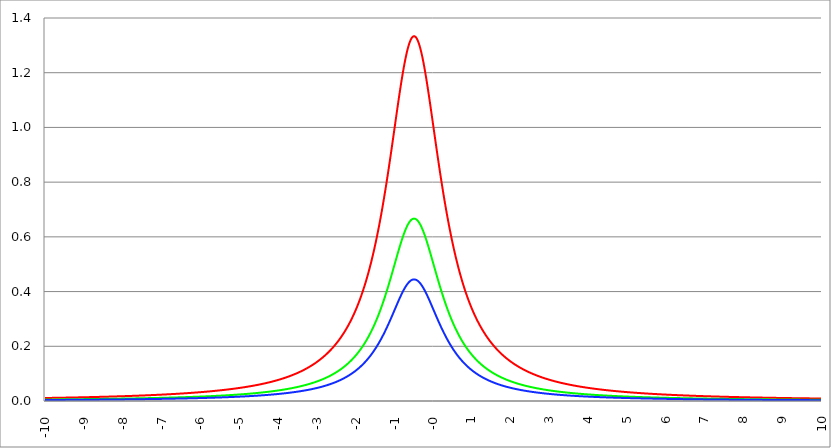
| Category | Series 1 | Series 0 | Series 2 |
|---|---|---|---|
| -10.0 | 0.011 | 0.005 | 0.004 |
| -9.99 | 0.011 | 0.006 | 0.004 |
| -9.98 | 0.011 | 0.006 | 0.004 |
| -9.97 | 0.011 | 0.006 | 0.004 |
| -9.96 | 0.011 | 0.006 | 0.004 |
| -9.95 | 0.011 | 0.006 | 0.004 |
| -9.940000000000001 | 0.011 | 0.006 | 0.004 |
| -9.930000000000001 | 0.011 | 0.006 | 0.004 |
| -9.920000000000002 | 0.011 | 0.006 | 0.004 |
| -9.91 | 0.011 | 0.006 | 0.004 |
| -9.900000000000002 | 0.011 | 0.006 | 0.004 |
| -9.890000000000002 | 0.011 | 0.006 | 0.004 |
| -9.880000000000003 | 0.011 | 0.006 | 0.004 |
| -9.870000000000003 | 0.011 | 0.006 | 0.004 |
| -9.860000000000001 | 0.011 | 0.006 | 0.004 |
| -9.850000000000003 | 0.011 | 0.006 | 0.004 |
| -9.840000000000003 | 0.011 | 0.006 | 0.004 |
| -9.830000000000004 | 0.011 | 0.006 | 0.004 |
| -9.820000000000004 | 0.011 | 0.006 | 0.004 |
| -9.810000000000004 | 0.011 | 0.006 | 0.004 |
| -9.800000000000004 | 0.011 | 0.006 | 0.004 |
| -9.790000000000004 | 0.011 | 0.006 | 0.004 |
| -9.780000000000005 | 0.012 | 0.006 | 0.004 |
| -9.770000000000005 | 0.012 | 0.006 | 0.004 |
| -9.760000000000005 | 0.012 | 0.006 | 0.004 |
| -9.750000000000005 | 0.012 | 0.006 | 0.004 |
| -9.740000000000006 | 0.012 | 0.006 | 0.004 |
| -9.730000000000006 | 0.012 | 0.006 | 0.004 |
| -9.720000000000006 | 0.012 | 0.006 | 0.004 |
| -9.710000000000006 | 0.012 | 0.006 | 0.004 |
| -9.700000000000006 | 0.012 | 0.006 | 0.004 |
| -9.690000000000007 | 0.012 | 0.006 | 0.004 |
| -9.680000000000007 | 0.012 | 0.006 | 0.004 |
| -9.670000000000007 | 0.012 | 0.006 | 0.004 |
| -9.660000000000007 | 0.012 | 0.006 | 0.004 |
| -9.650000000000007 | 0.012 | 0.006 | 0.004 |
| -9.640000000000008 | 0.012 | 0.006 | 0.004 |
| -9.630000000000008 | 0.012 | 0.006 | 0.004 |
| -9.620000000000008 | 0.012 | 0.006 | 0.004 |
| -9.610000000000008 | 0.012 | 0.006 | 0.004 |
| -9.600000000000009 | 0.012 | 0.006 | 0.004 |
| -9.590000000000009 | 0.012 | 0.006 | 0.004 |
| -9.580000000000007 | 0.012 | 0.006 | 0.004 |
| -9.57000000000001 | 0.012 | 0.006 | 0.004 |
| -9.56000000000001 | 0.012 | 0.006 | 0.004 |
| -9.55000000000001 | 0.012 | 0.006 | 0.004 |
| -9.54000000000001 | 0.012 | 0.006 | 0.004 |
| -9.53000000000001 | 0.012 | 0.006 | 0.004 |
| -9.52000000000001 | 0.012 | 0.006 | 0.004 |
| -9.51000000000001 | 0.012 | 0.006 | 0.004 |
| -9.50000000000001 | 0.012 | 0.006 | 0.004 |
| -9.49000000000001 | 0.012 | 0.006 | 0.004 |
| -9.48000000000001 | 0.012 | 0.006 | 0.004 |
| -9.47000000000001 | 0.012 | 0.006 | 0.004 |
| -9.46000000000001 | 0.012 | 0.006 | 0.004 |
| -9.45000000000001 | 0.012 | 0.006 | 0.004 |
| -9.44000000000001 | 0.012 | 0.006 | 0.004 |
| -9.430000000000012 | 0.012 | 0.006 | 0.004 |
| -9.420000000000012 | 0.012 | 0.006 | 0.004 |
| -9.410000000000013 | 0.012 | 0.006 | 0.004 |
| -9.400000000000013 | 0.013 | 0.006 | 0.004 |
| -9.390000000000011 | 0.013 | 0.006 | 0.004 |
| -9.380000000000013 | 0.013 | 0.006 | 0.004 |
| -9.370000000000013 | 0.013 | 0.006 | 0.004 |
| -9.360000000000014 | 0.013 | 0.006 | 0.004 |
| -9.350000000000014 | 0.013 | 0.006 | 0.004 |
| -9.340000000000014 | 0.013 | 0.006 | 0.004 |
| -9.330000000000014 | 0.013 | 0.006 | 0.004 |
| -9.320000000000014 | 0.013 | 0.006 | 0.004 |
| -9.310000000000015 | 0.013 | 0.006 | 0.004 |
| -9.300000000000013 | 0.013 | 0.006 | 0.004 |
| -9.290000000000015 | 0.013 | 0.006 | 0.004 |
| -9.280000000000015 | 0.013 | 0.006 | 0.004 |
| -9.270000000000016 | 0.013 | 0.006 | 0.004 |
| -9.260000000000016 | 0.013 | 0.006 | 0.004 |
| -9.250000000000014 | 0.013 | 0.006 | 0.004 |
| -9.240000000000016 | 0.013 | 0.006 | 0.004 |
| -9.230000000000016 | 0.013 | 0.006 | 0.004 |
| -9.220000000000017 | 0.013 | 0.007 | 0.004 |
| -9.210000000000017 | 0.013 | 0.007 | 0.004 |
| -9.200000000000017 | 0.013 | 0.007 | 0.004 |
| -9.190000000000017 | 0.013 | 0.007 | 0.004 |
| -9.180000000000017 | 0.013 | 0.007 | 0.004 |
| -9.170000000000018 | 0.013 | 0.007 | 0.004 |
| -9.160000000000016 | 0.013 | 0.007 | 0.004 |
| -9.150000000000018 | 0.013 | 0.007 | 0.004 |
| -9.140000000000018 | 0.013 | 0.007 | 0.004 |
| -9.130000000000019 | 0.013 | 0.007 | 0.004 |
| -9.120000000000019 | 0.013 | 0.007 | 0.004 |
| -9.110000000000017 | 0.013 | 0.007 | 0.004 |
| -9.10000000000002 | 0.013 | 0.007 | 0.004 |
| -9.09000000000002 | 0.013 | 0.007 | 0.004 |
| -9.08000000000002 | 0.013 | 0.007 | 0.004 |
| -9.07000000000002 | 0.013 | 0.007 | 0.004 |
| -9.06000000000002 | 0.014 | 0.007 | 0.005 |
| -9.05000000000002 | 0.014 | 0.007 | 0.005 |
| -9.04000000000002 | 0.014 | 0.007 | 0.005 |
| -9.03000000000002 | 0.014 | 0.007 | 0.005 |
| -9.020000000000021 | 0.014 | 0.007 | 0.005 |
| -9.010000000000021 | 0.014 | 0.007 | 0.005 |
| -9.000000000000021 | 0.014 | 0.007 | 0.005 |
| -8.990000000000022 | 0.014 | 0.007 | 0.005 |
| -8.980000000000022 | 0.014 | 0.007 | 0.005 |
| -8.97000000000002 | 0.014 | 0.007 | 0.005 |
| -8.960000000000022 | 0.014 | 0.007 | 0.005 |
| -8.950000000000022 | 0.014 | 0.007 | 0.005 |
| -8.940000000000023 | 0.014 | 0.007 | 0.005 |
| -8.930000000000023 | 0.014 | 0.007 | 0.005 |
| -8.920000000000023 | 0.014 | 0.007 | 0.005 |
| -8.910000000000023 | 0.014 | 0.007 | 0.005 |
| -8.900000000000023 | 0.014 | 0.007 | 0.005 |
| -8.890000000000024 | 0.014 | 0.007 | 0.005 |
| -8.880000000000024 | 0.014 | 0.007 | 0.005 |
| -8.870000000000024 | 0.014 | 0.007 | 0.005 |
| -8.860000000000024 | 0.014 | 0.007 | 0.005 |
| -8.850000000000025 | 0.014 | 0.007 | 0.005 |
| -8.840000000000025 | 0.014 | 0.007 | 0.005 |
| -8.830000000000025 | 0.014 | 0.007 | 0.005 |
| -8.820000000000025 | 0.014 | 0.007 | 0.005 |
| -8.810000000000025 | 0.014 | 0.007 | 0.005 |
| -8.800000000000026 | 0.014 | 0.007 | 0.005 |
| -8.790000000000026 | 0.014 | 0.007 | 0.005 |
| -8.780000000000026 | 0.014 | 0.007 | 0.005 |
| -8.770000000000026 | 0.014 | 0.007 | 0.005 |
| -8.760000000000026 | 0.014 | 0.007 | 0.005 |
| -8.750000000000027 | 0.015 | 0.007 | 0.005 |
| -8.740000000000027 | 0.015 | 0.007 | 0.005 |
| -8.730000000000027 | 0.015 | 0.007 | 0.005 |
| -8.720000000000027 | 0.015 | 0.007 | 0.005 |
| -8.710000000000027 | 0.015 | 0.007 | 0.005 |
| -8.700000000000028 | 0.015 | 0.007 | 0.005 |
| -8.690000000000028 | 0.015 | 0.007 | 0.005 |
| -8.680000000000028 | 0.015 | 0.007 | 0.005 |
| -8.670000000000028 | 0.015 | 0.007 | 0.005 |
| -8.660000000000029 | 0.015 | 0.007 | 0.005 |
| -8.650000000000029 | 0.015 | 0.007 | 0.005 |
| -8.640000000000029 | 0.015 | 0.007 | 0.005 |
| -8.63000000000003 | 0.015 | 0.007 | 0.005 |
| -8.62000000000003 | 0.015 | 0.007 | 0.005 |
| -8.61000000000003 | 0.015 | 0.008 | 0.005 |
| -8.60000000000003 | 0.015 | 0.008 | 0.005 |
| -8.59000000000003 | 0.015 | 0.008 | 0.005 |
| -8.58000000000003 | 0.015 | 0.008 | 0.005 |
| -8.57000000000003 | 0.015 | 0.008 | 0.005 |
| -8.56000000000003 | 0.015 | 0.008 | 0.005 |
| -8.55000000000003 | 0.015 | 0.008 | 0.005 |
| -8.540000000000031 | 0.015 | 0.008 | 0.005 |
| -8.530000000000031 | 0.015 | 0.008 | 0.005 |
| -8.520000000000032 | 0.015 | 0.008 | 0.005 |
| -8.510000000000032 | 0.015 | 0.008 | 0.005 |
| -8.50000000000003 | 0.015 | 0.008 | 0.005 |
| -8.490000000000032 | 0.015 | 0.008 | 0.005 |
| -8.480000000000032 | 0.016 | 0.008 | 0.005 |
| -8.470000000000033 | 0.016 | 0.008 | 0.005 |
| -8.460000000000033 | 0.016 | 0.008 | 0.005 |
| -8.450000000000033 | 0.016 | 0.008 | 0.005 |
| -8.440000000000033 | 0.016 | 0.008 | 0.005 |
| -8.430000000000033 | 0.016 | 0.008 | 0.005 |
| -8.420000000000034 | 0.016 | 0.008 | 0.005 |
| -8.410000000000032 | 0.016 | 0.008 | 0.005 |
| -8.400000000000034 | 0.016 | 0.008 | 0.005 |
| -8.390000000000034 | 0.016 | 0.008 | 0.005 |
| -8.380000000000035 | 0.016 | 0.008 | 0.005 |
| -8.370000000000035 | 0.016 | 0.008 | 0.005 |
| -8.360000000000033 | 0.016 | 0.008 | 0.005 |
| -8.350000000000035 | 0.016 | 0.008 | 0.005 |
| -8.340000000000035 | 0.016 | 0.008 | 0.005 |
| -8.330000000000036 | 0.016 | 0.008 | 0.005 |
| -8.320000000000036 | 0.016 | 0.008 | 0.005 |
| -8.310000000000034 | 0.016 | 0.008 | 0.005 |
| -8.300000000000036 | 0.016 | 0.008 | 0.005 |
| -8.290000000000036 | 0.016 | 0.008 | 0.005 |
| -8.280000000000037 | 0.016 | 0.008 | 0.005 |
| -8.270000000000037 | 0.016 | 0.008 | 0.005 |
| -8.260000000000037 | 0.016 | 0.008 | 0.005 |
| -8.250000000000037 | 0.016 | 0.008 | 0.005 |
| -8.240000000000038 | 0.016 | 0.008 | 0.005 |
| -8.230000000000038 | 0.017 | 0.008 | 0.006 |
| -8.220000000000038 | 0.017 | 0.008 | 0.006 |
| -8.210000000000038 | 0.017 | 0.008 | 0.006 |
| -8.200000000000038 | 0.017 | 0.008 | 0.006 |
| -8.190000000000039 | 0.017 | 0.008 | 0.006 |
| -8.180000000000039 | 0.017 | 0.008 | 0.006 |
| -8.170000000000037 | 0.017 | 0.008 | 0.006 |
| -8.16000000000004 | 0.017 | 0.008 | 0.006 |
| -8.15000000000004 | 0.017 | 0.008 | 0.006 |
| -8.14000000000004 | 0.017 | 0.008 | 0.006 |
| -8.13000000000004 | 0.017 | 0.008 | 0.006 |
| -8.12000000000004 | 0.017 | 0.009 | 0.006 |
| -8.11000000000004 | 0.017 | 0.009 | 0.006 |
| -8.10000000000004 | 0.017 | 0.009 | 0.006 |
| -8.09000000000004 | 0.017 | 0.009 | 0.006 |
| -8.08000000000004 | 0.017 | 0.009 | 0.006 |
| -8.07000000000004 | 0.017 | 0.009 | 0.006 |
| -8.06000000000004 | 0.017 | 0.009 | 0.006 |
| -8.05000000000004 | 0.017 | 0.009 | 0.006 |
| -8.040000000000042 | 0.017 | 0.009 | 0.006 |
| -8.03000000000004 | 0.017 | 0.009 | 0.006 |
| -8.020000000000042 | 0.017 | 0.009 | 0.006 |
| -8.010000000000042 | 0.017 | 0.009 | 0.006 |
| -8.000000000000043 | 0.018 | 0.009 | 0.006 |
| -7.990000000000043 | 0.018 | 0.009 | 0.006 |
| -7.980000000000043 | 0.018 | 0.009 | 0.006 |
| -7.970000000000043 | 0.018 | 0.009 | 0.006 |
| -7.960000000000043 | 0.018 | 0.009 | 0.006 |
| -7.950000000000044 | 0.018 | 0.009 | 0.006 |
| -7.940000000000044 | 0.018 | 0.009 | 0.006 |
| -7.930000000000044 | 0.018 | 0.009 | 0.006 |
| -7.920000000000044 | 0.018 | 0.009 | 0.006 |
| -7.910000000000044 | 0.018 | 0.009 | 0.006 |
| -7.900000000000044 | 0.018 | 0.009 | 0.006 |
| -7.890000000000045 | 0.018 | 0.009 | 0.006 |
| -7.880000000000045 | 0.018 | 0.009 | 0.006 |
| -7.870000000000045 | 0.018 | 0.009 | 0.006 |
| -7.860000000000046 | 0.018 | 0.009 | 0.006 |
| -7.850000000000046 | 0.018 | 0.009 | 0.006 |
| -7.840000000000046 | 0.018 | 0.009 | 0.006 |
| -7.830000000000046 | 0.018 | 0.009 | 0.006 |
| -7.820000000000046 | 0.018 | 0.009 | 0.006 |
| -7.810000000000047 | 0.018 | 0.009 | 0.006 |
| -7.800000000000047 | 0.019 | 0.009 | 0.006 |
| -7.790000000000047 | 0.019 | 0.009 | 0.006 |
| -7.780000000000047 | 0.019 | 0.009 | 0.006 |
| -7.770000000000047 | 0.019 | 0.009 | 0.006 |
| -7.760000000000048 | 0.019 | 0.009 | 0.006 |
| -7.750000000000048 | 0.019 | 0.009 | 0.006 |
| -7.740000000000048 | 0.019 | 0.009 | 0.006 |
| -7.730000000000048 | 0.019 | 0.009 | 0.006 |
| -7.720000000000049 | 0.019 | 0.009 | 0.006 |
| -7.710000000000049 | 0.019 | 0.009 | 0.006 |
| -7.700000000000049 | 0.019 | 0.01 | 0.006 |
| -7.690000000000049 | 0.019 | 0.01 | 0.006 |
| -7.680000000000049 | 0.019 | 0.01 | 0.006 |
| -7.67000000000005 | 0.019 | 0.01 | 0.006 |
| -7.66000000000005 | 0.019 | 0.01 | 0.006 |
| -7.65000000000005 | 0.019 | 0.01 | 0.006 |
| -7.64000000000005 | 0.019 | 0.01 | 0.006 |
| -7.63000000000005 | 0.019 | 0.01 | 0.006 |
| -7.620000000000051 | 0.019 | 0.01 | 0.006 |
| -7.610000000000051 | 0.019 | 0.01 | 0.006 |
| -7.600000000000051 | 0.02 | 0.01 | 0.007 |
| -7.590000000000051 | 0.02 | 0.01 | 0.007 |
| -7.580000000000052 | 0.02 | 0.01 | 0.007 |
| -7.570000000000052 | 0.02 | 0.01 | 0.007 |
| -7.560000000000052 | 0.02 | 0.01 | 0.007 |
| -7.550000000000052 | 0.02 | 0.01 | 0.007 |
| -7.540000000000052 | 0.02 | 0.01 | 0.007 |
| -7.530000000000053 | 0.02 | 0.01 | 0.007 |
| -7.520000000000053 | 0.02 | 0.01 | 0.007 |
| -7.510000000000053 | 0.02 | 0.01 | 0.007 |
| -7.500000000000053 | 0.02 | 0.01 | 0.007 |
| -7.490000000000053 | 0.02 | 0.01 | 0.007 |
| -7.480000000000054 | 0.02 | 0.01 | 0.007 |
| -7.470000000000054 | 0.02 | 0.01 | 0.007 |
| -7.460000000000054 | 0.02 | 0.01 | 0.007 |
| -7.450000000000054 | 0.02 | 0.01 | 0.007 |
| -7.440000000000054 | 0.02 | 0.01 | 0.007 |
| -7.430000000000054 | 0.021 | 0.01 | 0.007 |
| -7.420000000000055 | 0.021 | 0.01 | 0.007 |
| -7.410000000000055 | 0.021 | 0.01 | 0.007 |
| -7.400000000000055 | 0.021 | 0.01 | 0.007 |
| -7.390000000000056 | 0.021 | 0.01 | 0.007 |
| -7.380000000000056 | 0.021 | 0.01 | 0.007 |
| -7.370000000000056 | 0.021 | 0.01 | 0.007 |
| -7.360000000000056 | 0.021 | 0.01 | 0.007 |
| -7.350000000000056 | 0.021 | 0.01 | 0.007 |
| -7.340000000000057 | 0.021 | 0.011 | 0.007 |
| -7.330000000000057 | 0.021 | 0.011 | 0.007 |
| -7.320000000000057 | 0.021 | 0.011 | 0.007 |
| -7.310000000000057 | 0.021 | 0.011 | 0.007 |
| -7.300000000000058 | 0.021 | 0.011 | 0.007 |
| -7.290000000000058 | 0.021 | 0.011 | 0.007 |
| -7.280000000000058 | 0.021 | 0.011 | 0.007 |
| -7.270000000000058 | 0.021 | 0.011 | 0.007 |
| -7.260000000000058 | 0.022 | 0.011 | 0.007 |
| -7.250000000000059 | 0.022 | 0.011 | 0.007 |
| -7.240000000000059 | 0.022 | 0.011 | 0.007 |
| -7.23000000000006 | 0.022 | 0.011 | 0.007 |
| -7.220000000000059 | 0.022 | 0.011 | 0.007 |
| -7.210000000000059 | 0.022 | 0.011 | 0.007 |
| -7.20000000000006 | 0.022 | 0.011 | 0.007 |
| -7.19000000000006 | 0.022 | 0.011 | 0.007 |
| -7.18000000000006 | 0.022 | 0.011 | 0.007 |
| -7.17000000000006 | 0.022 | 0.011 | 0.007 |
| -7.160000000000061 | 0.022 | 0.011 | 0.007 |
| -7.150000000000061 | 0.022 | 0.011 | 0.007 |
| -7.140000000000061 | 0.022 | 0.011 | 0.007 |
| -7.130000000000061 | 0.022 | 0.011 | 0.007 |
| -7.120000000000061 | 0.022 | 0.011 | 0.007 |
| -7.110000000000062 | 0.023 | 0.011 | 0.008 |
| -7.100000000000062 | 0.023 | 0.011 | 0.008 |
| -7.090000000000062 | 0.023 | 0.011 | 0.008 |
| -7.080000000000062 | 0.023 | 0.011 | 0.008 |
| -7.070000000000062 | 0.023 | 0.011 | 0.008 |
| -7.060000000000063 | 0.023 | 0.011 | 0.008 |
| -7.050000000000063 | 0.023 | 0.011 | 0.008 |
| -7.040000000000063 | 0.023 | 0.011 | 0.008 |
| -7.030000000000063 | 0.023 | 0.012 | 0.008 |
| -7.020000000000064 | 0.023 | 0.012 | 0.008 |
| -7.010000000000064 | 0.023 | 0.012 | 0.008 |
| -7.000000000000064 | 0.023 | 0.012 | 0.008 |
| -6.990000000000064 | 0.023 | 0.012 | 0.008 |
| -6.980000000000064 | 0.023 | 0.012 | 0.008 |
| -6.970000000000064 | 0.023 | 0.012 | 0.008 |
| -6.960000000000064 | 0.024 | 0.012 | 0.008 |
| -6.950000000000064 | 0.024 | 0.012 | 0.008 |
| -6.940000000000065 | 0.024 | 0.012 | 0.008 |
| -6.930000000000065 | 0.024 | 0.012 | 0.008 |
| -6.920000000000065 | 0.024 | 0.012 | 0.008 |
| -6.910000000000065 | 0.024 | 0.012 | 0.008 |
| -6.900000000000066 | 0.024 | 0.012 | 0.008 |
| -6.890000000000066 | 0.024 | 0.012 | 0.008 |
| -6.880000000000066 | 0.024 | 0.012 | 0.008 |
| -6.870000000000066 | 0.024 | 0.012 | 0.008 |
| -6.860000000000067 | 0.024 | 0.012 | 0.008 |
| -6.850000000000067 | 0.024 | 0.012 | 0.008 |
| -6.840000000000067 | 0.024 | 0.012 | 0.008 |
| -6.830000000000067 | 0.024 | 0.012 | 0.008 |
| -6.820000000000068 | 0.025 | 0.012 | 0.008 |
| -6.810000000000068 | 0.025 | 0.012 | 0.008 |
| -6.800000000000068 | 0.025 | 0.012 | 0.008 |
| -6.790000000000068 | 0.025 | 0.012 | 0.008 |
| -6.780000000000068 | 0.025 | 0.012 | 0.008 |
| -6.770000000000068 | 0.025 | 0.012 | 0.008 |
| -6.760000000000069 | 0.025 | 0.013 | 0.008 |
| -6.75000000000007 | 0.025 | 0.013 | 0.008 |
| -6.74000000000007 | 0.025 | 0.013 | 0.008 |
| -6.73000000000007 | 0.025 | 0.013 | 0.008 |
| -6.72000000000007 | 0.025 | 0.013 | 0.008 |
| -6.71000000000007 | 0.025 | 0.013 | 0.008 |
| -6.70000000000007 | 0.026 | 0.013 | 0.009 |
| -6.69000000000007 | 0.026 | 0.013 | 0.009 |
| -6.680000000000071 | 0.026 | 0.013 | 0.009 |
| -6.670000000000071 | 0.026 | 0.013 | 0.009 |
| -6.660000000000071 | 0.026 | 0.013 | 0.009 |
| -6.650000000000071 | 0.026 | 0.013 | 0.009 |
| -6.640000000000072 | 0.026 | 0.013 | 0.009 |
| -6.630000000000072 | 0.026 | 0.013 | 0.009 |
| -6.620000000000072 | 0.026 | 0.013 | 0.009 |
| -6.610000000000072 | 0.026 | 0.013 | 0.009 |
| -6.600000000000072 | 0.026 | 0.013 | 0.009 |
| -6.590000000000073 | 0.026 | 0.013 | 0.009 |
| -6.580000000000073 | 0.027 | 0.013 | 0.009 |
| -6.570000000000073 | 0.027 | 0.013 | 0.009 |
| -6.560000000000073 | 0.027 | 0.013 | 0.009 |
| -6.550000000000074 | 0.027 | 0.013 | 0.009 |
| -6.540000000000074 | 0.027 | 0.013 | 0.009 |
| -6.530000000000074 | 0.027 | 0.013 | 0.009 |
| -6.520000000000074 | 0.027 | 0.014 | 0.009 |
| -6.510000000000074 | 0.027 | 0.014 | 0.009 |
| -6.500000000000074 | 0.027 | 0.014 | 0.009 |
| -6.490000000000074 | 0.027 | 0.014 | 0.009 |
| -6.480000000000074 | 0.027 | 0.014 | 0.009 |
| -6.470000000000075 | 0.027 | 0.014 | 0.009 |
| -6.460000000000075 | 0.028 | 0.014 | 0.009 |
| -6.450000000000075 | 0.028 | 0.014 | 0.009 |
| -6.440000000000075 | 0.028 | 0.014 | 0.009 |
| -6.430000000000076 | 0.028 | 0.014 | 0.009 |
| -6.420000000000076 | 0.028 | 0.014 | 0.009 |
| -6.410000000000076 | 0.028 | 0.014 | 0.009 |
| -6.400000000000076 | 0.028 | 0.014 | 0.009 |
| -6.390000000000077 | 0.028 | 0.014 | 0.009 |
| -6.380000000000077 | 0.028 | 0.014 | 0.009 |
| -6.370000000000077 | 0.028 | 0.014 | 0.009 |
| -6.360000000000078 | 0.028 | 0.014 | 0.009 |
| -6.350000000000078 | 0.029 | 0.014 | 0.01 |
| -6.340000000000078 | 0.029 | 0.014 | 0.01 |
| -6.330000000000078 | 0.029 | 0.014 | 0.01 |
| -6.320000000000078 | 0.029 | 0.014 | 0.01 |
| -6.310000000000079 | 0.029 | 0.014 | 0.01 |
| -6.300000000000079 | 0.029 | 0.015 | 0.01 |
| -6.29000000000008 | 0.029 | 0.015 | 0.01 |
| -6.28000000000008 | 0.029 | 0.015 | 0.01 |
| -6.27000000000008 | 0.029 | 0.015 | 0.01 |
| -6.26000000000008 | 0.029 | 0.015 | 0.01 |
| -6.25000000000008 | 0.03 | 0.015 | 0.01 |
| -6.24000000000008 | 0.03 | 0.015 | 0.01 |
| -6.23000000000008 | 0.03 | 0.015 | 0.01 |
| -6.220000000000081 | 0.03 | 0.015 | 0.01 |
| -6.210000000000081 | 0.03 | 0.015 | 0.01 |
| -6.200000000000081 | 0.03 | 0.015 | 0.01 |
| -6.190000000000081 | 0.03 | 0.015 | 0.01 |
| -6.180000000000081 | 0.03 | 0.015 | 0.01 |
| -6.170000000000082 | 0.03 | 0.015 | 0.01 |
| -6.160000000000082 | 0.031 | 0.015 | 0.01 |
| -6.150000000000082 | 0.031 | 0.015 | 0.01 |
| -6.140000000000082 | 0.031 | 0.015 | 0.01 |
| -6.130000000000082 | 0.031 | 0.015 | 0.01 |
| -6.120000000000083 | 0.031 | 0.015 | 0.01 |
| -6.110000000000083 | 0.031 | 0.016 | 0.01 |
| -6.100000000000083 | 0.031 | 0.016 | 0.01 |
| -6.090000000000083 | 0.031 | 0.016 | 0.01 |
| -6.080000000000084 | 0.031 | 0.016 | 0.01 |
| -6.070000000000084 | 0.031 | 0.016 | 0.01 |
| -6.060000000000084 | 0.032 | 0.016 | 0.011 |
| -6.050000000000084 | 0.032 | 0.016 | 0.011 |
| -6.040000000000084 | 0.032 | 0.016 | 0.011 |
| -6.030000000000084 | 0.032 | 0.016 | 0.011 |
| -6.020000000000085 | 0.032 | 0.016 | 0.011 |
| -6.010000000000085 | 0.032 | 0.016 | 0.011 |
| -6.000000000000085 | 0.032 | 0.016 | 0.011 |
| -5.990000000000085 | 0.032 | 0.016 | 0.011 |
| -5.980000000000085 | 0.032 | 0.016 | 0.011 |
| -5.970000000000085 | 0.033 | 0.016 | 0.011 |
| -5.960000000000086 | 0.033 | 0.016 | 0.011 |
| -5.950000000000086 | 0.033 | 0.016 | 0.011 |
| -5.940000000000086 | 0.033 | 0.016 | 0.011 |
| -5.930000000000086 | 0.033 | 0.017 | 0.011 |
| -5.920000000000087 | 0.033 | 0.017 | 0.011 |
| -5.910000000000087 | 0.033 | 0.017 | 0.011 |
| -5.900000000000087 | 0.033 | 0.017 | 0.011 |
| -5.890000000000088 | 0.034 | 0.017 | 0.011 |
| -5.880000000000088 | 0.034 | 0.017 | 0.011 |
| -5.870000000000088 | 0.034 | 0.017 | 0.011 |
| -5.860000000000088 | 0.034 | 0.017 | 0.011 |
| -5.850000000000088 | 0.034 | 0.017 | 0.011 |
| -5.840000000000089 | 0.034 | 0.017 | 0.011 |
| -5.830000000000089 | 0.034 | 0.017 | 0.011 |
| -5.820000000000089 | 0.034 | 0.017 | 0.011 |
| -5.810000000000089 | 0.035 | 0.017 | 0.012 |
| -5.800000000000089 | 0.035 | 0.017 | 0.012 |
| -5.79000000000009 | 0.035 | 0.017 | 0.012 |
| -5.78000000000009 | 0.035 | 0.017 | 0.012 |
| -5.77000000000009 | 0.035 | 0.018 | 0.012 |
| -5.76000000000009 | 0.035 | 0.018 | 0.012 |
| -5.750000000000091 | 0.035 | 0.018 | 0.012 |
| -5.740000000000091 | 0.035 | 0.018 | 0.012 |
| -5.730000000000091 | 0.036 | 0.018 | 0.012 |
| -5.720000000000091 | 0.036 | 0.018 | 0.012 |
| -5.710000000000091 | 0.036 | 0.018 | 0.012 |
| -5.700000000000092 | 0.036 | 0.018 | 0.012 |
| -5.690000000000092 | 0.036 | 0.018 | 0.012 |
| -5.680000000000092 | 0.036 | 0.018 | 0.012 |
| -5.670000000000092 | 0.036 | 0.018 | 0.012 |
| -5.660000000000092 | 0.037 | 0.018 | 0.012 |
| -5.650000000000093 | 0.037 | 0.018 | 0.012 |
| -5.640000000000093 | 0.037 | 0.018 | 0.012 |
| -5.630000000000093 | 0.037 | 0.018 | 0.012 |
| -5.620000000000093 | 0.037 | 0.019 | 0.012 |
| -5.610000000000093 | 0.037 | 0.019 | 0.012 |
| -5.600000000000094 | 0.037 | 0.019 | 0.012 |
| -5.590000000000094 | 0.038 | 0.019 | 0.013 |
| -5.580000000000094 | 0.038 | 0.019 | 0.013 |
| -5.570000000000094 | 0.038 | 0.019 | 0.013 |
| -5.560000000000095 | 0.038 | 0.019 | 0.013 |
| -5.550000000000095 | 0.038 | 0.019 | 0.013 |
| -5.540000000000095 | 0.038 | 0.019 | 0.013 |
| -5.530000000000095 | 0.038 | 0.019 | 0.013 |
| -5.520000000000095 | 0.039 | 0.019 | 0.013 |
| -5.510000000000096 | 0.039 | 0.019 | 0.013 |
| -5.500000000000096 | 0.039 | 0.019 | 0.013 |
| -5.490000000000096 | 0.039 | 0.019 | 0.013 |
| -5.480000000000096 | 0.039 | 0.02 | 0.013 |
| -5.470000000000096 | 0.039 | 0.02 | 0.013 |
| -5.460000000000097 | 0.039 | 0.02 | 0.013 |
| -5.450000000000097 | 0.04 | 0.02 | 0.013 |
| -5.440000000000097 | 0.04 | 0.02 | 0.013 |
| -5.430000000000097 | 0.04 | 0.02 | 0.013 |
| -5.420000000000098 | 0.04 | 0.02 | 0.013 |
| -5.410000000000098 | 0.04 | 0.02 | 0.013 |
| -5.400000000000098 | 0.04 | 0.02 | 0.013 |
| -5.390000000000098 | 0.041 | 0.02 | 0.014 |
| -5.380000000000098 | 0.041 | 0.02 | 0.014 |
| -5.370000000000099 | 0.041 | 0.02 | 0.014 |
| -5.360000000000099 | 0.041 | 0.021 | 0.014 |
| -5.350000000000099 | 0.041 | 0.021 | 0.014 |
| -5.340000000000099 | 0.041 | 0.021 | 0.014 |
| -5.330000000000099 | 0.042 | 0.021 | 0.014 |
| -5.3200000000001 | 0.042 | 0.021 | 0.014 |
| -5.3100000000001 | 0.042 | 0.021 | 0.014 |
| -5.3000000000001 | 0.042 | 0.021 | 0.014 |
| -5.2900000000001 | 0.042 | 0.021 | 0.014 |
| -5.2800000000001 | 0.042 | 0.021 | 0.014 |
| -5.2700000000001 | 0.043 | 0.021 | 0.014 |
| -5.260000000000101 | 0.043 | 0.021 | 0.014 |
| -5.250000000000101 | 0.043 | 0.021 | 0.014 |
| -5.240000000000101 | 0.043 | 0.022 | 0.014 |
| -5.230000000000101 | 0.043 | 0.022 | 0.014 |
| -5.220000000000102 | 0.043 | 0.022 | 0.014 |
| -5.210000000000102 | 0.044 | 0.022 | 0.015 |
| -5.200000000000102 | 0.044 | 0.022 | 0.015 |
| -5.190000000000103 | 0.044 | 0.022 | 0.015 |
| -5.180000000000103 | 0.044 | 0.022 | 0.015 |
| -5.170000000000103 | 0.044 | 0.022 | 0.015 |
| -5.160000000000103 | 0.045 | 0.022 | 0.015 |
| -5.150000000000103 | 0.045 | 0.022 | 0.015 |
| -5.140000000000104 | 0.045 | 0.022 | 0.015 |
| -5.130000000000104 | 0.045 | 0.023 | 0.015 |
| -5.120000000000104 | 0.045 | 0.023 | 0.015 |
| -5.110000000000104 | 0.045 | 0.023 | 0.015 |
| -5.100000000000104 | 0.046 | 0.023 | 0.015 |
| -5.090000000000104 | 0.046 | 0.023 | 0.015 |
| -5.080000000000104 | 0.046 | 0.023 | 0.015 |
| -5.070000000000105 | 0.046 | 0.023 | 0.015 |
| -5.060000000000105 | 0.046 | 0.023 | 0.015 |
| -5.050000000000105 | 0.047 | 0.023 | 0.016 |
| -5.040000000000105 | 0.047 | 0.023 | 0.016 |
| -5.030000000000105 | 0.047 | 0.024 | 0.016 |
| -5.020000000000106 | 0.047 | 0.024 | 0.016 |
| -5.010000000000106 | 0.047 | 0.024 | 0.016 |
| -5.000000000000106 | 0.048 | 0.024 | 0.016 |
| -4.990000000000106 | 0.048 | 0.024 | 0.016 |
| -4.980000000000106 | 0.048 | 0.024 | 0.016 |
| -4.970000000000107 | 0.048 | 0.024 | 0.016 |
| -4.960000000000107 | 0.048 | 0.024 | 0.016 |
| -4.950000000000107 | 0.049 | 0.024 | 0.016 |
| -4.940000000000107 | 0.049 | 0.024 | 0.016 |
| -4.930000000000108 | 0.049 | 0.025 | 0.016 |
| -4.920000000000108 | 0.049 | 0.025 | 0.016 |
| -4.910000000000108 | 0.05 | 0.025 | 0.017 |
| -4.900000000000108 | 0.05 | 0.025 | 0.017 |
| -4.890000000000109 | 0.05 | 0.025 | 0.017 |
| -4.88000000000011 | 0.05 | 0.025 | 0.017 |
| -4.87000000000011 | 0.05 | 0.025 | 0.017 |
| -4.86000000000011 | 0.051 | 0.025 | 0.017 |
| -4.85000000000011 | 0.051 | 0.025 | 0.017 |
| -4.84000000000011 | 0.051 | 0.026 | 0.017 |
| -4.83000000000011 | 0.051 | 0.026 | 0.017 |
| -4.82000000000011 | 0.052 | 0.026 | 0.017 |
| -4.810000000000111 | 0.052 | 0.026 | 0.017 |
| -4.800000000000111 | 0.052 | 0.026 | 0.017 |
| -4.790000000000111 | 0.052 | 0.026 | 0.017 |
| -4.780000000000111 | 0.052 | 0.026 | 0.017 |
| -4.770000000000111 | 0.053 | 0.026 | 0.018 |
| -4.760000000000112 | 0.053 | 0.026 | 0.018 |
| -4.750000000000112 | 0.053 | 0.027 | 0.018 |
| -4.740000000000112 | 0.053 | 0.027 | 0.018 |
| -4.730000000000112 | 0.054 | 0.027 | 0.018 |
| -4.720000000000112 | 0.054 | 0.027 | 0.018 |
| -4.710000000000113 | 0.054 | 0.027 | 0.018 |
| -4.700000000000113 | 0.054 | 0.027 | 0.018 |
| -4.690000000000113 | 0.055 | 0.027 | 0.018 |
| -4.680000000000113 | 0.055 | 0.027 | 0.018 |
| -4.670000000000114 | 0.055 | 0.028 | 0.018 |
| -4.660000000000114 | 0.055 | 0.028 | 0.018 |
| -4.650000000000114 | 0.056 | 0.028 | 0.019 |
| -4.640000000000114 | 0.056 | 0.028 | 0.019 |
| -4.630000000000114 | 0.056 | 0.028 | 0.019 |
| -4.620000000000115 | 0.056 | 0.028 | 0.019 |
| -4.610000000000115 | 0.057 | 0.028 | 0.019 |
| -4.600000000000115 | 0.057 | 0.028 | 0.019 |
| -4.590000000000115 | 0.057 | 0.029 | 0.019 |
| -4.580000000000115 | 0.057 | 0.029 | 0.019 |
| -4.570000000000115 | 0.058 | 0.029 | 0.019 |
| -4.560000000000116 | 0.058 | 0.029 | 0.019 |
| -4.550000000000116 | 0.058 | 0.029 | 0.019 |
| -4.540000000000116 | 0.059 | 0.029 | 0.02 |
| -4.530000000000116 | 0.059 | 0.029 | 0.02 |
| -4.520000000000117 | 0.059 | 0.03 | 0.02 |
| -4.510000000000117 | 0.059 | 0.03 | 0.02 |
| -4.500000000000117 | 0.06 | 0.03 | 0.02 |
| -4.490000000000117 | 0.06 | 0.03 | 0.02 |
| -4.480000000000117 | 0.06 | 0.03 | 0.02 |
| -4.470000000000117 | 0.061 | 0.03 | 0.02 |
| -4.460000000000118 | 0.061 | 0.03 | 0.02 |
| -4.450000000000118 | 0.061 | 0.031 | 0.02 |
| -4.440000000000118 | 0.061 | 0.031 | 0.02 |
| -4.430000000000118 | 0.062 | 0.031 | 0.021 |
| -4.420000000000119 | 0.062 | 0.031 | 0.021 |
| -4.41000000000012 | 0.062 | 0.031 | 0.021 |
| -4.40000000000012 | 0.063 | 0.031 | 0.021 |
| -4.39000000000012 | 0.063 | 0.031 | 0.021 |
| -4.38000000000012 | 0.063 | 0.032 | 0.021 |
| -4.37000000000012 | 0.064 | 0.032 | 0.021 |
| -4.36000000000012 | 0.064 | 0.032 | 0.021 |
| -4.35000000000012 | 0.064 | 0.032 | 0.021 |
| -4.34000000000012 | 0.065 | 0.032 | 0.022 |
| -4.33000000000012 | 0.065 | 0.032 | 0.022 |
| -4.320000000000121 | 0.065 | 0.033 | 0.022 |
| -4.310000000000121 | 0.066 | 0.033 | 0.022 |
| -4.300000000000121 | 0.066 | 0.033 | 0.022 |
| -4.290000000000121 | 0.066 | 0.033 | 0.022 |
| -4.280000000000121 | 0.066 | 0.033 | 0.022 |
| -4.270000000000122 | 0.067 | 0.033 | 0.022 |
| -4.260000000000122 | 0.067 | 0.034 | 0.022 |
| -4.250000000000122 | 0.068 | 0.034 | 0.023 |
| -4.240000000000122 | 0.068 | 0.034 | 0.023 |
| -4.230000000000122 | 0.068 | 0.034 | 0.023 |
| -4.220000000000123 | 0.069 | 0.034 | 0.023 |
| -4.210000000000123 | 0.069 | 0.034 | 0.023 |
| -4.200000000000123 | 0.069 | 0.035 | 0.023 |
| -4.190000000000124 | 0.07 | 0.035 | 0.023 |
| -4.180000000000124 | 0.07 | 0.035 | 0.023 |
| -4.170000000000124 | 0.07 | 0.035 | 0.023 |
| -4.160000000000124 | 0.071 | 0.035 | 0.024 |
| -4.150000000000124 | 0.071 | 0.036 | 0.024 |
| -4.140000000000124 | 0.071 | 0.036 | 0.024 |
| -4.130000000000125 | 0.072 | 0.036 | 0.024 |
| -4.120000000000125 | 0.072 | 0.036 | 0.024 |
| -4.110000000000125 | 0.073 | 0.036 | 0.024 |
| -4.100000000000125 | 0.073 | 0.036 | 0.024 |
| -4.090000000000125 | 0.073 | 0.037 | 0.024 |
| -4.080000000000126 | 0.074 | 0.037 | 0.025 |
| -4.070000000000126 | 0.074 | 0.037 | 0.025 |
| -4.060000000000126 | 0.074 | 0.037 | 0.025 |
| -4.050000000000126 | 0.075 | 0.037 | 0.025 |
| -4.040000000000127 | 0.075 | 0.038 | 0.025 |
| -4.030000000000127 | 0.076 | 0.038 | 0.025 |
| -4.020000000000127 | 0.076 | 0.038 | 0.025 |
| -4.010000000000127 | 0.077 | 0.038 | 0.026 |
| -4.000000000000127 | 0.077 | 0.038 | 0.026 |
| -3.990000000000128 | 0.077 | 0.039 | 0.026 |
| -3.980000000000128 | 0.078 | 0.039 | 0.026 |
| -3.970000000000129 | 0.078 | 0.039 | 0.026 |
| -3.960000000000129 | 0.079 | 0.039 | 0.026 |
| -3.950000000000129 | 0.079 | 0.04 | 0.026 |
| -3.940000000000129 | 0.079 | 0.04 | 0.026 |
| -3.930000000000129 | 0.08 | 0.04 | 0.027 |
| -3.92000000000013 | 0.08 | 0.04 | 0.027 |
| -3.91000000000013 | 0.081 | 0.04 | 0.027 |
| -3.90000000000013 | 0.081 | 0.041 | 0.027 |
| -3.89000000000013 | 0.082 | 0.041 | 0.027 |
| -3.88000000000013 | 0.082 | 0.041 | 0.027 |
| -3.870000000000131 | 0.083 | 0.041 | 0.028 |
| -3.860000000000131 | 0.083 | 0.042 | 0.028 |
| -3.850000000000131 | 0.084 | 0.042 | 0.028 |
| -3.840000000000131 | 0.084 | 0.042 | 0.028 |
| -3.830000000000131 | 0.084 | 0.042 | 0.028 |
| -3.820000000000132 | 0.085 | 0.042 | 0.028 |
| -3.810000000000132 | 0.085 | 0.043 | 0.028 |
| -3.800000000000132 | 0.086 | 0.043 | 0.029 |
| -3.790000000000132 | 0.086 | 0.043 | 0.029 |
| -3.780000000000132 | 0.087 | 0.043 | 0.029 |
| -3.770000000000133 | 0.087 | 0.044 | 0.029 |
| -3.760000000000133 | 0.088 | 0.044 | 0.029 |
| -3.750000000000133 | 0.088 | 0.044 | 0.029 |
| -3.740000000000133 | 0.089 | 0.044 | 0.03 |
| -3.730000000000134 | 0.089 | 0.045 | 0.03 |
| -3.720000000000134 | 0.09 | 0.045 | 0.03 |
| -3.710000000000134 | 0.09 | 0.045 | 0.03 |
| -3.700000000000134 | 0.091 | 0.045 | 0.03 |
| -3.690000000000134 | 0.092 | 0.046 | 0.031 |
| -3.680000000000135 | 0.092 | 0.046 | 0.031 |
| -3.670000000000135 | 0.093 | 0.046 | 0.031 |
| -3.660000000000135 | 0.093 | 0.047 | 0.031 |
| -3.650000000000135 | 0.094 | 0.047 | 0.031 |
| -3.640000000000135 | 0.094 | 0.047 | 0.031 |
| -3.630000000000136 | 0.095 | 0.047 | 0.032 |
| -3.620000000000136 | 0.095 | 0.048 | 0.032 |
| -3.610000000000136 | 0.096 | 0.048 | 0.032 |
| -3.600000000000136 | 0.097 | 0.048 | 0.032 |
| -3.590000000000137 | 0.097 | 0.049 | 0.032 |
| -3.580000000000137 | 0.098 | 0.049 | 0.033 |
| -3.570000000000137 | 0.098 | 0.049 | 0.033 |
| -3.560000000000137 | 0.099 | 0.049 | 0.033 |
| -3.550000000000137 | 0.099 | 0.05 | 0.033 |
| -3.540000000000138 | 0.1 | 0.05 | 0.033 |
| -3.530000000000138 | 0.101 | 0.05 | 0.034 |
| -3.520000000000138 | 0.101 | 0.051 | 0.034 |
| -3.510000000000138 | 0.102 | 0.051 | 0.034 |
| -3.500000000000139 | 0.103 | 0.051 | 0.034 |
| -3.490000000000139 | 0.103 | 0.052 | 0.034 |
| -3.480000000000139 | 0.104 | 0.052 | 0.035 |
| -3.470000000000139 | 0.104 | 0.052 | 0.035 |
| -3.460000000000139 | 0.105 | 0.053 | 0.035 |
| -3.45000000000014 | 0.106 | 0.053 | 0.035 |
| -3.44000000000014 | 0.106 | 0.053 | 0.035 |
| -3.43000000000014 | 0.107 | 0.054 | 0.036 |
| -3.42000000000014 | 0.108 | 0.054 | 0.036 |
| -3.41000000000014 | 0.108 | 0.054 | 0.036 |
| -3.400000000000141 | 0.109 | 0.055 | 0.036 |
| -3.390000000000141 | 0.11 | 0.055 | 0.037 |
| -3.380000000000141 | 0.111 | 0.055 | 0.037 |
| -3.370000000000141 | 0.111 | 0.056 | 0.037 |
| -3.360000000000141 | 0.112 | 0.056 | 0.037 |
| -3.350000000000142 | 0.113 | 0.056 | 0.038 |
| -3.340000000000142 | 0.113 | 0.057 | 0.038 |
| -3.330000000000142 | 0.114 | 0.057 | 0.038 |
| -3.320000000000142 | 0.115 | 0.057 | 0.038 |
| -3.310000000000143 | 0.116 | 0.058 | 0.039 |
| -3.300000000000143 | 0.116 | 0.058 | 0.039 |
| -3.290000000000143 | 0.117 | 0.059 | 0.039 |
| -3.280000000000143 | 0.118 | 0.059 | 0.039 |
| -3.270000000000143 | 0.119 | 0.059 | 0.04 |
| -3.260000000000144 | 0.12 | 0.06 | 0.04 |
| -3.250000000000144 | 0.12 | 0.06 | 0.04 |
| -3.240000000000144 | 0.121 | 0.061 | 0.04 |
| -3.230000000000144 | 0.122 | 0.061 | 0.041 |
| -3.220000000000145 | 0.123 | 0.061 | 0.041 |
| -3.210000000000145 | 0.124 | 0.062 | 0.041 |
| -3.200000000000145 | 0.124 | 0.062 | 0.041 |
| -3.190000000000145 | 0.125 | 0.063 | 0.042 |
| -3.180000000000145 | 0.126 | 0.063 | 0.042 |
| -3.170000000000146 | 0.127 | 0.063 | 0.042 |
| -3.160000000000146 | 0.128 | 0.064 | 0.043 |
| -3.150000000000146 | 0.129 | 0.064 | 0.043 |
| -3.140000000000146 | 0.13 | 0.065 | 0.043 |
| -3.130000000000146 | 0.13 | 0.065 | 0.043 |
| -3.120000000000147 | 0.131 | 0.066 | 0.044 |
| -3.110000000000147 | 0.132 | 0.066 | 0.044 |
| -3.100000000000147 | 0.133 | 0.067 | 0.044 |
| -3.090000000000147 | 0.134 | 0.067 | 0.045 |
| -3.080000000000147 | 0.135 | 0.068 | 0.045 |
| -3.070000000000148 | 0.136 | 0.068 | 0.045 |
| -3.060000000000148 | 0.137 | 0.068 | 0.046 |
| -3.050000000000148 | 0.138 | 0.069 | 0.046 |
| -3.040000000000148 | 0.139 | 0.069 | 0.046 |
| -3.030000000000149 | 0.14 | 0.07 | 0.047 |
| -3.020000000000149 | 0.141 | 0.07 | 0.047 |
| -3.010000000000149 | 0.142 | 0.071 | 0.047 |
| -3.000000000000149 | 0.143 | 0.071 | 0.048 |
| -2.990000000000149 | 0.144 | 0.072 | 0.048 |
| -2.98000000000015 | 0.145 | 0.072 | 0.048 |
| -2.97000000000015 | 0.146 | 0.073 | 0.049 |
| -2.96000000000015 | 0.147 | 0.074 | 0.049 |
| -2.95000000000015 | 0.148 | 0.074 | 0.049 |
| -2.94000000000015 | 0.149 | 0.075 | 0.05 |
| -2.930000000000151 | 0.15 | 0.075 | 0.05 |
| -2.920000000000151 | 0.151 | 0.076 | 0.05 |
| -2.910000000000151 | 0.152 | 0.076 | 0.051 |
| -2.900000000000151 | 0.154 | 0.077 | 0.051 |
| -2.890000000000151 | 0.155 | 0.077 | 0.052 |
| -2.880000000000152 | 0.156 | 0.078 | 0.052 |
| -2.870000000000152 | 0.157 | 0.079 | 0.052 |
| -2.860000000000152 | 0.158 | 0.079 | 0.053 |
| -2.850000000000152 | 0.159 | 0.08 | 0.053 |
| -2.840000000000153 | 0.161 | 0.08 | 0.054 |
| -2.830000000000153 | 0.162 | 0.081 | 0.054 |
| -2.820000000000153 | 0.163 | 0.082 | 0.054 |
| -2.810000000000153 | 0.164 | 0.082 | 0.055 |
| -2.800000000000153 | 0.166 | 0.083 | 0.055 |
| -2.790000000000154 | 0.167 | 0.083 | 0.056 |
| -2.780000000000154 | 0.168 | 0.084 | 0.056 |
| -2.770000000000154 | 0.169 | 0.085 | 0.056 |
| -2.760000000000154 | 0.171 | 0.085 | 0.057 |
| -2.750000000000154 | 0.172 | 0.086 | 0.057 |
| -2.740000000000155 | 0.173 | 0.087 | 0.058 |
| -2.730000000000155 | 0.175 | 0.087 | 0.058 |
| -2.720000000000155 | 0.176 | 0.088 | 0.059 |
| -2.710000000000155 | 0.177 | 0.089 | 0.059 |
| -2.700000000000156 | 0.179 | 0.089 | 0.06 |
| -2.690000000000156 | 0.18 | 0.09 | 0.06 |
| -2.680000000000156 | 0.182 | 0.091 | 0.061 |
| -2.670000000000156 | 0.183 | 0.092 | 0.061 |
| -2.660000000000156 | 0.185 | 0.092 | 0.062 |
| -2.650000000000157 | 0.186 | 0.093 | 0.062 |
| -2.640000000000157 | 0.188 | 0.094 | 0.063 |
| -2.630000000000157 | 0.189 | 0.095 | 0.063 |
| -2.620000000000157 | 0.191 | 0.095 | 0.064 |
| -2.610000000000157 | 0.192 | 0.096 | 0.064 |
| -2.600000000000158 | 0.194 | 0.097 | 0.065 |
| -2.590000000000158 | 0.195 | 0.098 | 0.065 |
| -2.580000000000158 | 0.197 | 0.098 | 0.066 |
| -2.570000000000158 | 0.199 | 0.099 | 0.066 |
| -2.560000000000159 | 0.2 | 0.1 | 0.067 |
| -2.550000000000159 | 0.202 | 0.101 | 0.067 |
| -2.54000000000016 | 0.204 | 0.102 | 0.068 |
| -2.530000000000159 | 0.205 | 0.103 | 0.068 |
| -2.520000000000159 | 0.207 | 0.104 | 0.069 |
| -2.51000000000016 | 0.209 | 0.104 | 0.07 |
| -2.50000000000016 | 0.211 | 0.105 | 0.07 |
| -2.49000000000016 | 0.212 | 0.106 | 0.071 |
| -2.48000000000016 | 0.214 | 0.107 | 0.071 |
| -2.47000000000016 | 0.216 | 0.108 | 0.072 |
| -2.460000000000161 | 0.218 | 0.109 | 0.073 |
| -2.450000000000161 | 0.22 | 0.11 | 0.073 |
| -2.440000000000161 | 0.222 | 0.111 | 0.074 |
| -2.430000000000161 | 0.223 | 0.112 | 0.074 |
| -2.420000000000162 | 0.225 | 0.113 | 0.075 |
| -2.410000000000162 | 0.227 | 0.114 | 0.076 |
| -2.400000000000162 | 0.229 | 0.115 | 0.076 |
| -2.390000000000162 | 0.231 | 0.116 | 0.077 |
| -2.380000000000162 | 0.233 | 0.117 | 0.078 |
| -2.370000000000163 | 0.235 | 0.118 | 0.078 |
| -2.360000000000163 | 0.238 | 0.119 | 0.079 |
| -2.350000000000163 | 0.24 | 0.12 | 0.08 |
| -2.340000000000163 | 0.242 | 0.121 | 0.081 |
| -2.330000000000163 | 0.244 | 0.122 | 0.081 |
| -2.320000000000164 | 0.246 | 0.123 | 0.082 |
| -2.310000000000164 | 0.248 | 0.124 | 0.083 |
| -2.300000000000164 | 0.251 | 0.125 | 0.084 |
| -2.290000000000164 | 0.253 | 0.126 | 0.084 |
| -2.280000000000165 | 0.255 | 0.128 | 0.085 |
| -2.270000000000165 | 0.258 | 0.129 | 0.086 |
| -2.260000000000165 | 0.26 | 0.13 | 0.087 |
| -2.250000000000165 | 0.262 | 0.131 | 0.087 |
| -2.240000000000165 | 0.265 | 0.132 | 0.088 |
| -2.230000000000166 | 0.267 | 0.134 | 0.089 |
| -2.220000000000166 | 0.27 | 0.135 | 0.09 |
| -2.210000000000166 | 0.272 | 0.136 | 0.091 |
| -2.200000000000166 | 0.275 | 0.137 | 0.092 |
| -2.190000000000166 | 0.277 | 0.139 | 0.092 |
| -2.180000000000167 | 0.28 | 0.14 | 0.093 |
| -2.170000000000167 | 0.283 | 0.141 | 0.094 |
| -2.160000000000167 | 0.285 | 0.143 | 0.095 |
| -2.150000000000167 | 0.288 | 0.144 | 0.096 |
| -2.140000000000168 | 0.291 | 0.145 | 0.097 |
| -2.130000000000168 | 0.294 | 0.147 | 0.098 |
| -2.120000000000168 | 0.296 | 0.148 | 0.099 |
| -2.110000000000168 | 0.299 | 0.15 | 0.1 |
| -2.100000000000168 | 0.302 | 0.151 | 0.101 |
| -2.090000000000169 | 0.305 | 0.153 | 0.102 |
| -2.080000000000169 | 0.308 | 0.154 | 0.103 |
| -2.070000000000169 | 0.311 | 0.156 | 0.104 |
| -2.060000000000169 | 0.314 | 0.157 | 0.105 |
| -2.050000000000169 | 0.317 | 0.159 | 0.106 |
| -2.04000000000017 | 0.32 | 0.16 | 0.107 |
| -2.03000000000017 | 0.324 | 0.162 | 0.108 |
| -2.02000000000017 | 0.327 | 0.163 | 0.109 |
| -2.01000000000017 | 0.33 | 0.165 | 0.11 |
| -2.000000000000171 | 0.333 | 0.167 | 0.111 |
| -1.99000000000017 | 0.337 | 0.168 | 0.112 |
| -1.98000000000017 | 0.34 | 0.17 | 0.113 |
| -1.97000000000017 | 0.344 | 0.172 | 0.115 |
| -1.96000000000017 | 0.347 | 0.174 | 0.116 |
| -1.95000000000017 | 0.351 | 0.175 | 0.117 |
| -1.94000000000017 | 0.354 | 0.177 | 0.118 |
| -1.93000000000017 | 0.358 | 0.179 | 0.119 |
| -1.92000000000017 | 0.361 | 0.181 | 0.12 |
| -1.91000000000017 | 0.365 | 0.183 | 0.122 |
| -1.90000000000017 | 0.369 | 0.185 | 0.123 |
| -1.89000000000017 | 0.373 | 0.186 | 0.124 |
| -1.88000000000017 | 0.377 | 0.188 | 0.126 |
| -1.87000000000017 | 0.381 | 0.19 | 0.127 |
| -1.86000000000017 | 0.385 | 0.192 | 0.128 |
| -1.85000000000017 | 0.389 | 0.194 | 0.13 |
| -1.84000000000017 | 0.393 | 0.196 | 0.131 |
| -1.83000000000017 | 0.397 | 0.198 | 0.132 |
| -1.82000000000017 | 0.401 | 0.201 | 0.134 |
| -1.81000000000017 | 0.405 | 0.203 | 0.135 |
| -1.80000000000017 | 0.41 | 0.205 | 0.137 |
| -1.79000000000017 | 0.414 | 0.207 | 0.138 |
| -1.78000000000017 | 0.419 | 0.209 | 0.14 |
| -1.77000000000017 | 0.423 | 0.212 | 0.141 |
| -1.76000000000017 | 0.428 | 0.214 | 0.143 |
| -1.75000000000017 | 0.432 | 0.216 | 0.144 |
| -1.74000000000017 | 0.437 | 0.219 | 0.146 |
| -1.73000000000017 | 0.442 | 0.221 | 0.147 |
| -1.72000000000017 | 0.447 | 0.223 | 0.149 |
| -1.71000000000017 | 0.452 | 0.226 | 0.151 |
| -1.70000000000017 | 0.457 | 0.228 | 0.152 |
| -1.69000000000017 | 0.462 | 0.231 | 0.154 |
| -1.68000000000017 | 0.467 | 0.233 | 0.156 |
| -1.67000000000017 | 0.472 | 0.236 | 0.157 |
| -1.66000000000017 | 0.477 | 0.239 | 0.159 |
| -1.65000000000017 | 0.483 | 0.241 | 0.161 |
| -1.64000000000017 | 0.488 | 0.244 | 0.163 |
| -1.63000000000017 | 0.493 | 0.247 | 0.164 |
| -1.62000000000017 | 0.499 | 0.249 | 0.166 |
| -1.61000000000017 | 0.505 | 0.252 | 0.168 |
| -1.60000000000017 | 0.51 | 0.255 | 0.17 |
| -1.59000000000017 | 0.516 | 0.258 | 0.172 |
| -1.58000000000017 | 0.522 | 0.261 | 0.174 |
| -1.57000000000017 | 0.528 | 0.264 | 0.176 |
| -1.56000000000017 | 0.534 | 0.267 | 0.178 |
| -1.55000000000017 | 0.54 | 0.27 | 0.18 |
| -1.54000000000017 | 0.546 | 0.273 | 0.182 |
| -1.53000000000017 | 0.552 | 0.276 | 0.184 |
| -1.52000000000017 | 0.559 | 0.279 | 0.186 |
| -1.51000000000017 | 0.565 | 0.282 | 0.188 |
| -1.50000000000017 | 0.571 | 0.286 | 0.19 |
| -1.49000000000017 | 0.578 | 0.289 | 0.193 |
| -1.48000000000017 | 0.585 | 0.292 | 0.195 |
| -1.47000000000017 | 0.591 | 0.296 | 0.197 |
| -1.46000000000017 | 0.598 | 0.299 | 0.199 |
| -1.45000000000017 | 0.605 | 0.303 | 0.202 |
| -1.44000000000017 | 0.612 | 0.306 | 0.204 |
| -1.43000000000017 | 0.619 | 0.31 | 0.206 |
| -1.42000000000017 | 0.626 | 0.313 | 0.209 |
| -1.41000000000017 | 0.634 | 0.317 | 0.211 |
| -1.40000000000017 | 0.641 | 0.321 | 0.214 |
| -1.39000000000017 | 0.648 | 0.324 | 0.216 |
| -1.38000000000017 | 0.656 | 0.328 | 0.219 |
| -1.37000000000017 | 0.664 | 0.332 | 0.221 |
| -1.36000000000017 | 0.671 | 0.336 | 0.224 |
| -1.35000000000017 | 0.679 | 0.34 | 0.226 |
| -1.34000000000017 | 0.687 | 0.344 | 0.229 |
| -1.33000000000017 | 0.695 | 0.347 | 0.232 |
| -1.32000000000017 | 0.703 | 0.352 | 0.234 |
| -1.31000000000017 | 0.711 | 0.356 | 0.237 |
| -1.30000000000017 | 0.719 | 0.36 | 0.24 |
| -1.29000000000017 | 0.728 | 0.364 | 0.243 |
| -1.28000000000017 | 0.736 | 0.368 | 0.245 |
| -1.27000000000017 | 0.745 | 0.372 | 0.248 |
| -1.26000000000017 | 0.753 | 0.377 | 0.251 |
| -1.25000000000017 | 0.762 | 0.381 | 0.254 |
| -1.24000000000017 | 0.771 | 0.385 | 0.257 |
| -1.23000000000017 | 0.779 | 0.39 | 0.26 |
| -1.22000000000017 | 0.788 | 0.394 | 0.263 |
| -1.21000000000017 | 0.797 | 0.399 | 0.266 |
| -1.20000000000017 | 0.806 | 0.403 | 0.269 |
| -1.19000000000017 | 0.816 | 0.408 | 0.272 |
| -1.18000000000017 | 0.825 | 0.412 | 0.275 |
| -1.17000000000017 | 0.834 | 0.417 | 0.278 |
| -1.16000000000017 | 0.843 | 0.422 | 0.281 |
| -1.15000000000017 | 0.853 | 0.426 | 0.284 |
| -1.14000000000017 | 0.862 | 0.431 | 0.287 |
| -1.13000000000017 | 0.872 | 0.436 | 0.291 |
| -1.12000000000017 | 0.882 | 0.441 | 0.294 |
| -1.11000000000017 | 0.891 | 0.446 | 0.297 |
| -1.10000000000017 | 0.901 | 0.45 | 0.3 |
| -1.09000000000017 | 0.911 | 0.455 | 0.304 |
| -1.08000000000017 | 0.92 | 0.46 | 0.307 |
| -1.07000000000017 | 0.93 | 0.465 | 0.31 |
| -1.06000000000017 | 0.94 | 0.47 | 0.313 |
| -1.05000000000017 | 0.95 | 0.475 | 0.317 |
| -1.04000000000017 | 0.96 | 0.48 | 0.32 |
| -1.03000000000017 | 0.97 | 0.485 | 0.323 |
| -1.02000000000017 | 0.98 | 0.49 | 0.327 |
| -1.01000000000017 | 0.99 | 0.495 | 0.33 |
| -1.00000000000017 | 1 | 0.5 | 0.333 |
| -0.99000000000017 | 1.01 | 0.505 | 0.337 |
| -0.98000000000017 | 1.02 | 0.51 | 0.34 |
| -0.97000000000017 | 1.03 | 0.515 | 0.343 |
| -0.96000000000017 | 1.04 | 0.52 | 0.347 |
| -0.95000000000017 | 1.05 | 0.525 | 0.35 |
| -0.94000000000017 | 1.06 | 0.53 | 0.353 |
| -0.93000000000017 | 1.07 | 0.535 | 0.357 |
| -0.92000000000017 | 1.079 | 0.54 | 0.36 |
| -0.91000000000017 | 1.089 | 0.545 | 0.363 |
| -0.90000000000017 | 1.099 | 0.549 | 0.366 |
| -0.890000000000169 | 1.109 | 0.554 | 0.37 |
| -0.880000000000169 | 1.118 | 0.559 | 0.373 |
| -0.870000000000169 | 1.128 | 0.564 | 0.376 |
| -0.860000000000169 | 1.137 | 0.568 | 0.379 |
| -0.850000000000169 | 1.146 | 0.573 | 0.382 |
| -0.840000000000169 | 1.155 | 0.578 | 0.385 |
| -0.830000000000169 | 1.164 | 0.582 | 0.388 |
| -0.820000000000169 | 1.173 | 0.587 | 0.391 |
| -0.810000000000169 | 1.182 | 0.591 | 0.394 |
| -0.800000000000169 | 1.19 | 0.595 | 0.397 |
| -0.790000000000169 | 1.199 | 0.599 | 0.4 |
| -0.780000000000169 | 1.207 | 0.604 | 0.402 |
| -0.770000000000169 | 1.215 | 0.608 | 0.405 |
| -0.760000000000169 | 1.223 | 0.612 | 0.408 |
| -0.750000000000169 | 1.231 | 0.615 | 0.41 |
| -0.740000000000169 | 1.238 | 0.619 | 0.413 |
| -0.730000000000169 | 1.245 | 0.623 | 0.415 |
| -0.720000000000169 | 1.253 | 0.626 | 0.418 |
| -0.710000000000169 | 1.259 | 0.63 | 0.42 |
| -0.700000000000169 | 1.266 | 0.633 | 0.422 |
| -0.690000000000169 | 1.272 | 0.636 | 0.424 |
| -0.680000000000169 | 1.278 | 0.639 | 0.426 |
| -0.670000000000169 | 1.284 | 0.642 | 0.428 |
| -0.660000000000169 | 1.289 | 0.645 | 0.43 |
| -0.650000000000169 | 1.294 | 0.647 | 0.431 |
| -0.640000000000169 | 1.299 | 0.65 | 0.433 |
| -0.630000000000169 | 1.304 | 0.652 | 0.435 |
| -0.620000000000169 | 1.308 | 0.654 | 0.436 |
| -0.610000000000169 | 1.312 | 0.656 | 0.437 |
| -0.600000000000169 | 1.316 | 0.658 | 0.439 |
| -0.590000000000169 | 1.319 | 0.66 | 0.44 |
| -0.580000000000169 | 1.322 | 0.661 | 0.441 |
| -0.570000000000169 | 1.325 | 0.662 | 0.442 |
| -0.560000000000169 | 1.327 | 0.663 | 0.442 |
| -0.550000000000169 | 1.329 | 0.664 | 0.443 |
| -0.540000000000169 | 1.33 | 0.665 | 0.443 |
| -0.530000000000169 | 1.332 | 0.666 | 0.444 |
| -0.520000000000169 | 1.333 | 0.666 | 0.444 |
| -0.510000000000169 | 1.333 | 0.667 | 0.444 |
| -0.500000000000169 | 1.333 | 0.667 | 0.444 |
| -0.490000000000169 | 1.333 | 0.667 | 0.444 |
| -0.480000000000169 | 1.333 | 0.666 | 0.444 |
| -0.470000000000169 | 1.332 | 0.666 | 0.444 |
| -0.460000000000169 | 1.33 | 0.665 | 0.443 |
| -0.450000000000169 | 1.329 | 0.664 | 0.443 |
| -0.440000000000169 | 1.327 | 0.663 | 0.442 |
| -0.430000000000169 | 1.325 | 0.662 | 0.442 |
| -0.420000000000169 | 1.322 | 0.661 | 0.441 |
| -0.410000000000169 | 1.319 | 0.66 | 0.44 |
| -0.400000000000169 | 1.316 | 0.658 | 0.439 |
| -0.390000000000169 | 1.312 | 0.656 | 0.437 |
| -0.380000000000169 | 1.308 | 0.654 | 0.436 |
| -0.370000000000169 | 1.304 | 0.652 | 0.435 |
| -0.360000000000169 | 1.299 | 0.65 | 0.433 |
| -0.350000000000169 | 1.294 | 0.647 | 0.431 |
| -0.340000000000169 | 1.289 | 0.645 | 0.43 |
| -0.330000000000169 | 1.284 | 0.642 | 0.428 |
| -0.320000000000169 | 1.278 | 0.639 | 0.426 |
| -0.310000000000169 | 1.272 | 0.636 | 0.424 |
| -0.300000000000169 | 1.266 | 0.633 | 0.422 |
| -0.290000000000169 | 1.259 | 0.63 | 0.42 |
| -0.280000000000169 | 1.253 | 0.626 | 0.418 |
| -0.270000000000169 | 1.245 | 0.623 | 0.415 |
| -0.260000000000169 | 1.238 | 0.619 | 0.413 |
| -0.250000000000169 | 1.231 | 0.615 | 0.41 |
| -0.240000000000169 | 1.223 | 0.612 | 0.408 |
| -0.230000000000169 | 1.215 | 0.608 | 0.405 |
| -0.220000000000169 | 1.207 | 0.604 | 0.402 |
| -0.210000000000169 | 1.199 | 0.599 | 0.4 |
| -0.200000000000169 | 1.19 | 0.595 | 0.397 |
| -0.190000000000169 | 1.182 | 0.591 | 0.394 |
| -0.180000000000169 | 1.173 | 0.587 | 0.391 |
| -0.170000000000169 | 1.164 | 0.582 | 0.388 |
| -0.160000000000169 | 1.155 | 0.578 | 0.385 |
| -0.150000000000169 | 1.146 | 0.573 | 0.382 |
| -0.140000000000169 | 1.137 | 0.568 | 0.379 |
| -0.130000000000169 | 1.128 | 0.564 | 0.376 |
| -0.120000000000169 | 1.118 | 0.559 | 0.373 |
| -0.110000000000169 | 1.109 | 0.554 | 0.37 |
| -0.100000000000169 | 1.099 | 0.549 | 0.366 |
| -0.0900000000001689 | 1.089 | 0.545 | 0.363 |
| -0.0800000000001689 | 1.079 | 0.54 | 0.36 |
| -0.0700000000001689 | 1.07 | 0.535 | 0.357 |
| -0.0600000000001689 | 1.06 | 0.53 | 0.353 |
| -0.0500000000001689 | 1.05 | 0.525 | 0.35 |
| -0.0400000000001689 | 1.04 | 0.52 | 0.347 |
| -0.0300000000001689 | 1.03 | 0.515 | 0.343 |
| -0.0200000000001689 | 1.02 | 0.51 | 0.34 |
| -0.0100000000001689 | 1.01 | 0.505 | 0.337 |
| -1.6888920817415e-13 | 1 | 0.5 | 0.333 |
| 0.00999999999983111 | 0.99 | 0.495 | 0.33 |
| 0.0199999999998311 | 0.98 | 0.49 | 0.327 |
| 0.0299999999998311 | 0.97 | 0.485 | 0.323 |
| 0.0399999999998311 | 0.96 | 0.48 | 0.32 |
| 0.0499999999998311 | 0.95 | 0.475 | 0.317 |
| 0.0599999999998311 | 0.94 | 0.47 | 0.313 |
| 0.0699999999998311 | 0.93 | 0.465 | 0.31 |
| 0.0799999999998311 | 0.92 | 0.46 | 0.307 |
| 0.0899999999998311 | 0.911 | 0.455 | 0.304 |
| 0.0999999999998311 | 0.901 | 0.45 | 0.3 |
| 0.109999999999831 | 0.891 | 0.446 | 0.297 |
| 0.119999999999831 | 0.882 | 0.441 | 0.294 |
| 0.129999999999831 | 0.872 | 0.436 | 0.291 |
| 0.139999999999831 | 0.862 | 0.431 | 0.287 |
| 0.149999999999831 | 0.853 | 0.426 | 0.284 |
| 0.159999999999831 | 0.843 | 0.422 | 0.281 |
| 0.169999999999831 | 0.834 | 0.417 | 0.278 |
| 0.179999999999831 | 0.825 | 0.412 | 0.275 |
| 0.189999999999831 | 0.816 | 0.408 | 0.272 |
| 0.199999999999831 | 0.806 | 0.403 | 0.269 |
| 0.209999999999831 | 0.797 | 0.399 | 0.266 |
| 0.219999999999831 | 0.788 | 0.394 | 0.263 |
| 0.229999999999831 | 0.779 | 0.39 | 0.26 |
| 0.239999999999831 | 0.771 | 0.385 | 0.257 |
| 0.249999999999831 | 0.762 | 0.381 | 0.254 |
| 0.259999999999831 | 0.753 | 0.377 | 0.251 |
| 0.269999999999831 | 0.745 | 0.372 | 0.248 |
| 0.279999999999831 | 0.736 | 0.368 | 0.245 |
| 0.289999999999831 | 0.728 | 0.364 | 0.243 |
| 0.299999999999831 | 0.719 | 0.36 | 0.24 |
| 0.309999999999831 | 0.711 | 0.356 | 0.237 |
| 0.319999999999831 | 0.703 | 0.352 | 0.234 |
| 0.329999999999831 | 0.695 | 0.347 | 0.232 |
| 0.339999999999831 | 0.687 | 0.344 | 0.229 |
| 0.349999999999831 | 0.679 | 0.34 | 0.226 |
| 0.359999999999831 | 0.671 | 0.336 | 0.224 |
| 0.369999999999831 | 0.664 | 0.332 | 0.221 |
| 0.379999999999831 | 0.656 | 0.328 | 0.219 |
| 0.389999999999831 | 0.648 | 0.324 | 0.216 |
| 0.399999999999831 | 0.641 | 0.321 | 0.214 |
| 0.409999999999831 | 0.634 | 0.317 | 0.211 |
| 0.419999999999831 | 0.626 | 0.313 | 0.209 |
| 0.429999999999831 | 0.619 | 0.31 | 0.206 |
| 0.439999999999831 | 0.612 | 0.306 | 0.204 |
| 0.449999999999831 | 0.605 | 0.303 | 0.202 |
| 0.459999999999831 | 0.598 | 0.299 | 0.199 |
| 0.469999999999831 | 0.591 | 0.296 | 0.197 |
| 0.479999999999831 | 0.585 | 0.292 | 0.195 |
| 0.489999999999831 | 0.578 | 0.289 | 0.193 |
| 0.499999999999831 | 0.571 | 0.286 | 0.19 |
| 0.509999999999831 | 0.565 | 0.282 | 0.188 |
| 0.519999999999831 | 0.559 | 0.279 | 0.186 |
| 0.529999999999831 | 0.552 | 0.276 | 0.184 |
| 0.539999999999831 | 0.546 | 0.273 | 0.182 |
| 0.549999999999831 | 0.54 | 0.27 | 0.18 |
| 0.559999999999831 | 0.534 | 0.267 | 0.178 |
| 0.569999999999831 | 0.528 | 0.264 | 0.176 |
| 0.579999999999831 | 0.522 | 0.261 | 0.174 |
| 0.589999999999831 | 0.516 | 0.258 | 0.172 |
| 0.599999999999831 | 0.51 | 0.255 | 0.17 |
| 0.609999999999831 | 0.505 | 0.252 | 0.168 |
| 0.619999999999831 | 0.499 | 0.249 | 0.166 |
| 0.629999999999831 | 0.493 | 0.247 | 0.164 |
| 0.639999999999831 | 0.488 | 0.244 | 0.163 |
| 0.649999999999831 | 0.483 | 0.241 | 0.161 |
| 0.659999999999831 | 0.477 | 0.239 | 0.159 |
| 0.669999999999831 | 0.472 | 0.236 | 0.157 |
| 0.679999999999831 | 0.467 | 0.233 | 0.156 |
| 0.689999999999831 | 0.462 | 0.231 | 0.154 |
| 0.699999999999831 | 0.457 | 0.228 | 0.152 |
| 0.709999999999831 | 0.452 | 0.226 | 0.151 |
| 0.719999999999831 | 0.447 | 0.223 | 0.149 |
| 0.729999999999831 | 0.442 | 0.221 | 0.147 |
| 0.739999999999831 | 0.437 | 0.219 | 0.146 |
| 0.749999999999832 | 0.432 | 0.216 | 0.144 |
| 0.759999999999832 | 0.428 | 0.214 | 0.143 |
| 0.769999999999832 | 0.423 | 0.212 | 0.141 |
| 0.779999999999832 | 0.419 | 0.209 | 0.14 |
| 0.789999999999832 | 0.414 | 0.207 | 0.138 |
| 0.799999999999832 | 0.41 | 0.205 | 0.137 |
| 0.809999999999832 | 0.405 | 0.203 | 0.135 |
| 0.819999999999832 | 0.401 | 0.201 | 0.134 |
| 0.829999999999832 | 0.397 | 0.198 | 0.132 |
| 0.839999999999832 | 0.393 | 0.196 | 0.131 |
| 0.849999999999832 | 0.389 | 0.194 | 0.13 |
| 0.859999999999832 | 0.385 | 0.192 | 0.128 |
| 0.869999999999832 | 0.381 | 0.19 | 0.127 |
| 0.879999999999832 | 0.377 | 0.188 | 0.126 |
| 0.889999999999832 | 0.373 | 0.186 | 0.124 |
| 0.899999999999832 | 0.369 | 0.185 | 0.123 |
| 0.909999999999832 | 0.365 | 0.183 | 0.122 |
| 0.919999999999832 | 0.361 | 0.181 | 0.12 |
| 0.929999999999832 | 0.358 | 0.179 | 0.119 |
| 0.939999999999832 | 0.354 | 0.177 | 0.118 |
| 0.949999999999832 | 0.351 | 0.175 | 0.117 |
| 0.959999999999832 | 0.347 | 0.174 | 0.116 |
| 0.969999999999832 | 0.344 | 0.172 | 0.115 |
| 0.979999999999832 | 0.34 | 0.17 | 0.113 |
| 0.989999999999832 | 0.337 | 0.168 | 0.112 |
| 0.999999999999832 | 0.333 | 0.167 | 0.111 |
| 1.009999999999832 | 0.33 | 0.165 | 0.11 |
| 1.019999999999832 | 0.327 | 0.163 | 0.109 |
| 1.029999999999832 | 0.324 | 0.162 | 0.108 |
| 1.039999999999832 | 0.32 | 0.16 | 0.107 |
| 1.049999999999832 | 0.317 | 0.159 | 0.106 |
| 1.059999999999832 | 0.314 | 0.157 | 0.105 |
| 1.069999999999832 | 0.311 | 0.156 | 0.104 |
| 1.079999999999832 | 0.308 | 0.154 | 0.103 |
| 1.089999999999832 | 0.305 | 0.153 | 0.102 |
| 1.099999999999832 | 0.302 | 0.151 | 0.101 |
| 1.109999999999832 | 0.299 | 0.15 | 0.1 |
| 1.119999999999832 | 0.296 | 0.148 | 0.099 |
| 1.129999999999832 | 0.294 | 0.147 | 0.098 |
| 1.139999999999832 | 0.291 | 0.145 | 0.097 |
| 1.149999999999832 | 0.288 | 0.144 | 0.096 |
| 1.159999999999832 | 0.285 | 0.143 | 0.095 |
| 1.169999999999832 | 0.283 | 0.141 | 0.094 |
| 1.179999999999832 | 0.28 | 0.14 | 0.093 |
| 1.189999999999832 | 0.277 | 0.139 | 0.092 |
| 1.199999999999832 | 0.275 | 0.137 | 0.092 |
| 1.209999999999832 | 0.272 | 0.136 | 0.091 |
| 1.219999999999832 | 0.27 | 0.135 | 0.09 |
| 1.229999999999832 | 0.267 | 0.134 | 0.089 |
| 1.239999999999832 | 0.265 | 0.132 | 0.088 |
| 1.249999999999832 | 0.262 | 0.131 | 0.087 |
| 1.259999999999832 | 0.26 | 0.13 | 0.087 |
| 1.269999999999832 | 0.258 | 0.129 | 0.086 |
| 1.279999999999832 | 0.255 | 0.128 | 0.085 |
| 1.289999999999832 | 0.253 | 0.126 | 0.084 |
| 1.299999999999832 | 0.251 | 0.125 | 0.084 |
| 1.309999999999832 | 0.248 | 0.124 | 0.083 |
| 1.319999999999832 | 0.246 | 0.123 | 0.082 |
| 1.329999999999832 | 0.244 | 0.122 | 0.081 |
| 1.339999999999832 | 0.242 | 0.121 | 0.081 |
| 1.349999999999832 | 0.24 | 0.12 | 0.08 |
| 1.359999999999832 | 0.238 | 0.119 | 0.079 |
| 1.369999999999832 | 0.235 | 0.118 | 0.078 |
| 1.379999999999832 | 0.233 | 0.117 | 0.078 |
| 1.389999999999832 | 0.231 | 0.116 | 0.077 |
| 1.399999999999832 | 0.229 | 0.115 | 0.076 |
| 1.409999999999832 | 0.227 | 0.114 | 0.076 |
| 1.419999999999832 | 0.225 | 0.113 | 0.075 |
| 1.429999999999832 | 0.223 | 0.112 | 0.074 |
| 1.439999999999832 | 0.222 | 0.111 | 0.074 |
| 1.449999999999832 | 0.22 | 0.11 | 0.073 |
| 1.459999999999832 | 0.218 | 0.109 | 0.073 |
| 1.469999999999832 | 0.216 | 0.108 | 0.072 |
| 1.479999999999832 | 0.214 | 0.107 | 0.071 |
| 1.489999999999832 | 0.212 | 0.106 | 0.071 |
| 1.499999999999832 | 0.211 | 0.105 | 0.07 |
| 1.509999999999832 | 0.209 | 0.104 | 0.07 |
| 1.519999999999832 | 0.207 | 0.104 | 0.069 |
| 1.529999999999832 | 0.205 | 0.103 | 0.068 |
| 1.539999999999832 | 0.204 | 0.102 | 0.068 |
| 1.549999999999832 | 0.202 | 0.101 | 0.067 |
| 1.559999999999832 | 0.2 | 0.1 | 0.067 |
| 1.569999999999832 | 0.199 | 0.099 | 0.066 |
| 1.579999999999832 | 0.197 | 0.098 | 0.066 |
| 1.589999999999832 | 0.195 | 0.098 | 0.065 |
| 1.599999999999832 | 0.194 | 0.097 | 0.065 |
| 1.609999999999832 | 0.192 | 0.096 | 0.064 |
| 1.619999999999832 | 0.191 | 0.095 | 0.064 |
| 1.629999999999832 | 0.189 | 0.095 | 0.063 |
| 1.639999999999832 | 0.188 | 0.094 | 0.063 |
| 1.649999999999832 | 0.186 | 0.093 | 0.062 |
| 1.659999999999832 | 0.185 | 0.092 | 0.062 |
| 1.669999999999832 | 0.183 | 0.092 | 0.061 |
| 1.679999999999832 | 0.182 | 0.091 | 0.061 |
| 1.689999999999832 | 0.18 | 0.09 | 0.06 |
| 1.699999999999832 | 0.179 | 0.089 | 0.06 |
| 1.709999999999832 | 0.177 | 0.089 | 0.059 |
| 1.719999999999832 | 0.176 | 0.088 | 0.059 |
| 1.729999999999832 | 0.175 | 0.087 | 0.058 |
| 1.739999999999832 | 0.173 | 0.087 | 0.058 |
| 1.749999999999832 | 0.172 | 0.086 | 0.057 |
| 1.759999999999832 | 0.171 | 0.085 | 0.057 |
| 1.769999999999832 | 0.169 | 0.085 | 0.056 |
| 1.779999999999832 | 0.168 | 0.084 | 0.056 |
| 1.789999999999832 | 0.167 | 0.083 | 0.056 |
| 1.799999999999832 | 0.166 | 0.083 | 0.055 |
| 1.809999999999832 | 0.164 | 0.082 | 0.055 |
| 1.819999999999832 | 0.163 | 0.082 | 0.054 |
| 1.829999999999832 | 0.162 | 0.081 | 0.054 |
| 1.839999999999832 | 0.161 | 0.08 | 0.054 |
| 1.849999999999832 | 0.159 | 0.08 | 0.053 |
| 1.859999999999832 | 0.158 | 0.079 | 0.053 |
| 1.869999999999832 | 0.157 | 0.079 | 0.052 |
| 1.879999999999832 | 0.156 | 0.078 | 0.052 |
| 1.889999999999832 | 0.155 | 0.077 | 0.052 |
| 1.899999999999832 | 0.154 | 0.077 | 0.051 |
| 1.909999999999832 | 0.152 | 0.076 | 0.051 |
| 1.919999999999832 | 0.151 | 0.076 | 0.05 |
| 1.929999999999832 | 0.15 | 0.075 | 0.05 |
| 1.939999999999832 | 0.149 | 0.075 | 0.05 |
| 1.949999999999833 | 0.148 | 0.074 | 0.049 |
| 1.959999999999833 | 0.147 | 0.074 | 0.049 |
| 1.969999999999833 | 0.146 | 0.073 | 0.049 |
| 1.979999999999833 | 0.145 | 0.072 | 0.048 |
| 1.989999999999833 | 0.144 | 0.072 | 0.048 |
| 1.999999999999833 | 0.143 | 0.071 | 0.048 |
| 2.009999999999832 | 0.142 | 0.071 | 0.047 |
| 2.019999999999832 | 0.141 | 0.07 | 0.047 |
| 2.029999999999832 | 0.14 | 0.07 | 0.047 |
| 2.039999999999832 | 0.139 | 0.069 | 0.046 |
| 2.049999999999832 | 0.138 | 0.069 | 0.046 |
| 2.059999999999831 | 0.137 | 0.068 | 0.046 |
| 2.069999999999831 | 0.136 | 0.068 | 0.045 |
| 2.079999999999831 | 0.135 | 0.068 | 0.045 |
| 2.089999999999831 | 0.134 | 0.067 | 0.045 |
| 2.09999999999983 | 0.133 | 0.067 | 0.044 |
| 2.10999999999983 | 0.132 | 0.066 | 0.044 |
| 2.11999999999983 | 0.131 | 0.066 | 0.044 |
| 2.12999999999983 | 0.13 | 0.065 | 0.043 |
| 2.13999999999983 | 0.13 | 0.065 | 0.043 |
| 2.149999999999829 | 0.129 | 0.064 | 0.043 |
| 2.159999999999829 | 0.128 | 0.064 | 0.043 |
| 2.169999999999829 | 0.127 | 0.063 | 0.042 |
| 2.179999999999829 | 0.126 | 0.063 | 0.042 |
| 2.189999999999829 | 0.125 | 0.063 | 0.042 |
| 2.199999999999828 | 0.124 | 0.062 | 0.041 |
| 2.209999999999828 | 0.124 | 0.062 | 0.041 |
| 2.219999999999828 | 0.123 | 0.061 | 0.041 |
| 2.229999999999828 | 0.122 | 0.061 | 0.041 |
| 2.239999999999827 | 0.121 | 0.061 | 0.04 |
| 2.249999999999827 | 0.12 | 0.06 | 0.04 |
| 2.259999999999827 | 0.12 | 0.06 | 0.04 |
| 2.269999999999827 | 0.119 | 0.059 | 0.04 |
| 2.279999999999827 | 0.118 | 0.059 | 0.039 |
| 2.289999999999826 | 0.117 | 0.059 | 0.039 |
| 2.299999999999826 | 0.116 | 0.058 | 0.039 |
| 2.309999999999826 | 0.116 | 0.058 | 0.039 |
| 2.319999999999826 | 0.115 | 0.057 | 0.038 |
| 2.329999999999825 | 0.114 | 0.057 | 0.038 |
| 2.339999999999825 | 0.113 | 0.057 | 0.038 |
| 2.349999999999825 | 0.113 | 0.056 | 0.038 |
| 2.359999999999825 | 0.112 | 0.056 | 0.037 |
| 2.369999999999825 | 0.111 | 0.056 | 0.037 |
| 2.379999999999824 | 0.111 | 0.055 | 0.037 |
| 2.389999999999824 | 0.11 | 0.055 | 0.037 |
| 2.399999999999824 | 0.109 | 0.055 | 0.036 |
| 2.409999999999824 | 0.108 | 0.054 | 0.036 |
| 2.419999999999824 | 0.108 | 0.054 | 0.036 |
| 2.429999999999823 | 0.107 | 0.054 | 0.036 |
| 2.439999999999823 | 0.106 | 0.053 | 0.035 |
| 2.449999999999823 | 0.106 | 0.053 | 0.035 |
| 2.459999999999823 | 0.105 | 0.053 | 0.035 |
| 2.469999999999823 | 0.104 | 0.052 | 0.035 |
| 2.479999999999822 | 0.104 | 0.052 | 0.035 |
| 2.489999999999822 | 0.103 | 0.052 | 0.034 |
| 2.499999999999822 | 0.103 | 0.051 | 0.034 |
| 2.509999999999822 | 0.102 | 0.051 | 0.034 |
| 2.519999999999821 | 0.101 | 0.051 | 0.034 |
| 2.529999999999821 | 0.101 | 0.05 | 0.034 |
| 2.539999999999821 | 0.1 | 0.05 | 0.033 |
| 2.549999999999821 | 0.099 | 0.05 | 0.033 |
| 2.559999999999821 | 0.099 | 0.049 | 0.033 |
| 2.56999999999982 | 0.098 | 0.049 | 0.033 |
| 2.57999999999982 | 0.098 | 0.049 | 0.033 |
| 2.58999999999982 | 0.097 | 0.049 | 0.032 |
| 2.59999999999982 | 0.097 | 0.048 | 0.032 |
| 2.609999999999819 | 0.096 | 0.048 | 0.032 |
| 2.619999999999819 | 0.095 | 0.048 | 0.032 |
| 2.629999999999819 | 0.095 | 0.047 | 0.032 |
| 2.639999999999819 | 0.094 | 0.047 | 0.031 |
| 2.649999999999819 | 0.094 | 0.047 | 0.031 |
| 2.659999999999818 | 0.093 | 0.047 | 0.031 |
| 2.669999999999818 | 0.093 | 0.046 | 0.031 |
| 2.679999999999818 | 0.092 | 0.046 | 0.031 |
| 2.689999999999818 | 0.092 | 0.046 | 0.031 |
| 2.699999999999818 | 0.091 | 0.045 | 0.03 |
| 2.709999999999817 | 0.09 | 0.045 | 0.03 |
| 2.719999999999817 | 0.09 | 0.045 | 0.03 |
| 2.729999999999817 | 0.089 | 0.045 | 0.03 |
| 2.739999999999817 | 0.089 | 0.044 | 0.03 |
| 2.749999999999817 | 0.088 | 0.044 | 0.029 |
| 2.759999999999816 | 0.088 | 0.044 | 0.029 |
| 2.769999999999816 | 0.087 | 0.044 | 0.029 |
| 2.779999999999816 | 0.087 | 0.043 | 0.029 |
| 2.789999999999816 | 0.086 | 0.043 | 0.029 |
| 2.799999999999815 | 0.086 | 0.043 | 0.029 |
| 2.809999999999815 | 0.085 | 0.043 | 0.028 |
| 2.819999999999815 | 0.085 | 0.042 | 0.028 |
| 2.829999999999815 | 0.084 | 0.042 | 0.028 |
| 2.839999999999815 | 0.084 | 0.042 | 0.028 |
| 2.849999999999814 | 0.084 | 0.042 | 0.028 |
| 2.859999999999814 | 0.083 | 0.042 | 0.028 |
| 2.869999999999814 | 0.083 | 0.041 | 0.028 |
| 2.879999999999814 | 0.082 | 0.041 | 0.027 |
| 2.889999999999814 | 0.082 | 0.041 | 0.027 |
| 2.899999999999813 | 0.081 | 0.041 | 0.027 |
| 2.909999999999813 | 0.081 | 0.04 | 0.027 |
| 2.919999999999813 | 0.08 | 0.04 | 0.027 |
| 2.929999999999813 | 0.08 | 0.04 | 0.027 |
| 2.939999999999813 | 0.079 | 0.04 | 0.026 |
| 2.949999999999812 | 0.079 | 0.04 | 0.026 |
| 2.959999999999812 | 0.079 | 0.039 | 0.026 |
| 2.969999999999812 | 0.078 | 0.039 | 0.026 |
| 2.979999999999812 | 0.078 | 0.039 | 0.026 |
| 2.989999999999811 | 0.077 | 0.039 | 0.026 |
| 2.999999999999811 | 0.077 | 0.038 | 0.026 |
| 3.009999999999811 | 0.077 | 0.038 | 0.026 |
| 3.019999999999811 | 0.076 | 0.038 | 0.025 |
| 3.029999999999811 | 0.076 | 0.038 | 0.025 |
| 3.03999999999981 | 0.075 | 0.038 | 0.025 |
| 3.04999999999981 | 0.075 | 0.037 | 0.025 |
| 3.05999999999981 | 0.074 | 0.037 | 0.025 |
| 3.06999999999981 | 0.074 | 0.037 | 0.025 |
| 3.07999999999981 | 0.074 | 0.037 | 0.025 |
| 3.089999999999809 | 0.073 | 0.037 | 0.024 |
| 3.099999999999809 | 0.073 | 0.036 | 0.024 |
| 3.109999999999809 | 0.073 | 0.036 | 0.024 |
| 3.119999999999809 | 0.072 | 0.036 | 0.024 |
| 3.129999999999808 | 0.072 | 0.036 | 0.024 |
| 3.139999999999808 | 0.071 | 0.036 | 0.024 |
| 3.149999999999808 | 0.071 | 0.036 | 0.024 |
| 3.159999999999808 | 0.071 | 0.035 | 0.024 |
| 3.169999999999808 | 0.07 | 0.035 | 0.023 |
| 3.179999999999807 | 0.07 | 0.035 | 0.023 |
| 3.189999999999807 | 0.07 | 0.035 | 0.023 |
| 3.199999999999807 | 0.069 | 0.035 | 0.023 |
| 3.209999999999807 | 0.069 | 0.034 | 0.023 |
| 3.219999999999807 | 0.069 | 0.034 | 0.023 |
| 3.229999999999806 | 0.068 | 0.034 | 0.023 |
| 3.239999999999806 | 0.068 | 0.034 | 0.023 |
| 3.249999999999806 | 0.068 | 0.034 | 0.023 |
| 3.259999999999806 | 0.067 | 0.034 | 0.022 |
| 3.269999999999805 | 0.067 | 0.033 | 0.022 |
| 3.279999999999805 | 0.066 | 0.033 | 0.022 |
| 3.289999999999805 | 0.066 | 0.033 | 0.022 |
| 3.299999999999805 | 0.066 | 0.033 | 0.022 |
| 3.309999999999805 | 0.066 | 0.033 | 0.022 |
| 3.319999999999804 | 0.065 | 0.033 | 0.022 |
| 3.329999999999804 | 0.065 | 0.032 | 0.022 |
| 3.339999999999804 | 0.065 | 0.032 | 0.022 |
| 3.349999999999804 | 0.064 | 0.032 | 0.021 |
| 3.359999999999804 | 0.064 | 0.032 | 0.021 |
| 3.369999999999803 | 0.064 | 0.032 | 0.021 |
| 3.379999999999803 | 0.063 | 0.032 | 0.021 |
| 3.389999999999803 | 0.063 | 0.031 | 0.021 |
| 3.399999999999803 | 0.063 | 0.031 | 0.021 |
| 3.409999999999802 | 0.062 | 0.031 | 0.021 |
| 3.419999999999802 | 0.062 | 0.031 | 0.021 |
| 3.429999999999802 | 0.062 | 0.031 | 0.021 |
| 3.439999999999802 | 0.061 | 0.031 | 0.02 |
| 3.449999999999802 | 0.061 | 0.031 | 0.02 |
| 3.459999999999801 | 0.061 | 0.03 | 0.02 |
| 3.469999999999801 | 0.061 | 0.03 | 0.02 |
| 3.479999999999801 | 0.06 | 0.03 | 0.02 |
| 3.489999999999801 | 0.06 | 0.03 | 0.02 |
| 3.499999999999801 | 0.06 | 0.03 | 0.02 |
| 3.5099999999998 | 0.059 | 0.03 | 0.02 |
| 3.5199999999998 | 0.059 | 0.03 | 0.02 |
| 3.5299999999998 | 0.059 | 0.029 | 0.02 |
| 3.5399999999998 | 0.059 | 0.029 | 0.02 |
| 3.5499999999998 | 0.058 | 0.029 | 0.019 |
| 3.559999999999799 | 0.058 | 0.029 | 0.019 |
| 3.569999999999799 | 0.058 | 0.029 | 0.019 |
| 3.579999999999799 | 0.057 | 0.029 | 0.019 |
| 3.589999999999799 | 0.057 | 0.029 | 0.019 |
| 3.599999999999798 | 0.057 | 0.028 | 0.019 |
| 3.609999999999798 | 0.057 | 0.028 | 0.019 |
| 3.619999999999798 | 0.056 | 0.028 | 0.019 |
| 3.629999999999798 | 0.056 | 0.028 | 0.019 |
| 3.639999999999798 | 0.056 | 0.028 | 0.019 |
| 3.649999999999797 | 0.056 | 0.028 | 0.019 |
| 3.659999999999797 | 0.055 | 0.028 | 0.018 |
| 3.669999999999797 | 0.055 | 0.028 | 0.018 |
| 3.679999999999797 | 0.055 | 0.027 | 0.018 |
| 3.689999999999796 | 0.055 | 0.027 | 0.018 |
| 3.699999999999796 | 0.054 | 0.027 | 0.018 |
| 3.709999999999796 | 0.054 | 0.027 | 0.018 |
| 3.719999999999796 | 0.054 | 0.027 | 0.018 |
| 3.729999999999796 | 0.054 | 0.027 | 0.018 |
| 3.739999999999795 | 0.053 | 0.027 | 0.018 |
| 3.749999999999795 | 0.053 | 0.027 | 0.018 |
| 3.759999999999795 | 0.053 | 0.026 | 0.018 |
| 3.769999999999795 | 0.053 | 0.026 | 0.018 |
| 3.779999999999795 | 0.052 | 0.026 | 0.017 |
| 3.789999999999794 | 0.052 | 0.026 | 0.017 |
| 3.799999999999794 | 0.052 | 0.026 | 0.017 |
| 3.809999999999794 | 0.052 | 0.026 | 0.017 |
| 3.819999999999794 | 0.052 | 0.026 | 0.017 |
| 3.829999999999794 | 0.051 | 0.026 | 0.017 |
| 3.839999999999793 | 0.051 | 0.026 | 0.017 |
| 3.849999999999793 | 0.051 | 0.025 | 0.017 |
| 3.859999999999793 | 0.051 | 0.025 | 0.017 |
| 3.869999999999793 | 0.05 | 0.025 | 0.017 |
| 3.879999999999792 | 0.05 | 0.025 | 0.017 |
| 3.889999999999792 | 0.05 | 0.025 | 0.017 |
| 3.899999999999792 | 0.05 | 0.025 | 0.017 |
| 3.909999999999792 | 0.05 | 0.025 | 0.017 |
| 3.919999999999792 | 0.049 | 0.025 | 0.016 |
| 3.929999999999791 | 0.049 | 0.025 | 0.016 |
| 3.939999999999791 | 0.049 | 0.024 | 0.016 |
| 3.949999999999791 | 0.049 | 0.024 | 0.016 |
| 3.959999999999791 | 0.048 | 0.024 | 0.016 |
| 3.969999999999791 | 0.048 | 0.024 | 0.016 |
| 3.97999999999979 | 0.048 | 0.024 | 0.016 |
| 3.98999999999979 | 0.048 | 0.024 | 0.016 |
| 3.99999999999979 | 0.048 | 0.024 | 0.016 |
| 4.00999999999979 | 0.047 | 0.024 | 0.016 |
| 4.01999999999979 | 0.047 | 0.024 | 0.016 |
| 4.02999999999979 | 0.047 | 0.024 | 0.016 |
| 4.03999999999979 | 0.047 | 0.023 | 0.016 |
| 4.04999999999979 | 0.047 | 0.023 | 0.016 |
| 4.05999999999979 | 0.046 | 0.023 | 0.015 |
| 4.069999999999789 | 0.046 | 0.023 | 0.015 |
| 4.079999999999788 | 0.046 | 0.023 | 0.015 |
| 4.089999999999788 | 0.046 | 0.023 | 0.015 |
| 4.099999999999788 | 0.046 | 0.023 | 0.015 |
| 4.109999999999788 | 0.045 | 0.023 | 0.015 |
| 4.119999999999788 | 0.045 | 0.023 | 0.015 |
| 4.129999999999788 | 0.045 | 0.023 | 0.015 |
| 4.139999999999787 | 0.045 | 0.022 | 0.015 |
| 4.149999999999787 | 0.045 | 0.022 | 0.015 |
| 4.159999999999787 | 0.045 | 0.022 | 0.015 |
| 4.169999999999787 | 0.044 | 0.022 | 0.015 |
| 4.179999999999786 | 0.044 | 0.022 | 0.015 |
| 4.189999999999786 | 0.044 | 0.022 | 0.015 |
| 4.199999999999786 | 0.044 | 0.022 | 0.015 |
| 4.209999999999785 | 0.044 | 0.022 | 0.015 |
| 4.219999999999785 | 0.043 | 0.022 | 0.014 |
| 4.229999999999785 | 0.043 | 0.022 | 0.014 |
| 4.239999999999785 | 0.043 | 0.022 | 0.014 |
| 4.249999999999785 | 0.043 | 0.021 | 0.014 |
| 4.259999999999784 | 0.043 | 0.021 | 0.014 |
| 4.269999999999784 | 0.043 | 0.021 | 0.014 |
| 4.279999999999784 | 0.042 | 0.021 | 0.014 |
| 4.289999999999784 | 0.042 | 0.021 | 0.014 |
| 4.299999999999784 | 0.042 | 0.021 | 0.014 |
| 4.309999999999784 | 0.042 | 0.021 | 0.014 |
| 4.319999999999784 | 0.042 | 0.021 | 0.014 |
| 4.329999999999783 | 0.042 | 0.021 | 0.014 |
| 4.339999999999783 | 0.041 | 0.021 | 0.014 |
| 4.349999999999783 | 0.041 | 0.021 | 0.014 |
| 4.359999999999783 | 0.041 | 0.021 | 0.014 |
| 4.369999999999782 | 0.041 | 0.02 | 0.014 |
| 4.379999999999782 | 0.041 | 0.02 | 0.014 |
| 4.389999999999782 | 0.041 | 0.02 | 0.014 |
| 4.399999999999782 | 0.04 | 0.02 | 0.013 |
| 4.409999999999781 | 0.04 | 0.02 | 0.013 |
| 4.419999999999781 | 0.04 | 0.02 | 0.013 |
| 4.429999999999781 | 0.04 | 0.02 | 0.013 |
| 4.43999999999978 | 0.04 | 0.02 | 0.013 |
| 4.44999999999978 | 0.04 | 0.02 | 0.013 |
| 4.45999999999978 | 0.039 | 0.02 | 0.013 |
| 4.46999999999978 | 0.039 | 0.02 | 0.013 |
| 4.47999999999978 | 0.039 | 0.02 | 0.013 |
| 4.48999999999978 | 0.039 | 0.019 | 0.013 |
| 4.49999999999978 | 0.039 | 0.019 | 0.013 |
| 4.50999999999978 | 0.039 | 0.019 | 0.013 |
| 4.51999999999978 | 0.039 | 0.019 | 0.013 |
| 4.52999999999978 | 0.038 | 0.019 | 0.013 |
| 4.539999999999778 | 0.038 | 0.019 | 0.013 |
| 4.549999999999778 | 0.038 | 0.019 | 0.013 |
| 4.559999999999778 | 0.038 | 0.019 | 0.013 |
| 4.569999999999778 | 0.038 | 0.019 | 0.013 |
| 4.579999999999778 | 0.038 | 0.019 | 0.013 |
| 4.589999999999777 | 0.038 | 0.019 | 0.013 |
| 4.599999999999777 | 0.037 | 0.019 | 0.012 |
| 4.609999999999777 | 0.037 | 0.019 | 0.012 |
| 4.619999999999777 | 0.037 | 0.019 | 0.012 |
| 4.629999999999777 | 0.037 | 0.018 | 0.012 |
| 4.639999999999776 | 0.037 | 0.018 | 0.012 |
| 4.649999999999776 | 0.037 | 0.018 | 0.012 |
| 4.659999999999776 | 0.037 | 0.018 | 0.012 |
| 4.669999999999776 | 0.036 | 0.018 | 0.012 |
| 4.679999999999775 | 0.036 | 0.018 | 0.012 |
| 4.689999999999775 | 0.036 | 0.018 | 0.012 |
| 4.699999999999775 | 0.036 | 0.018 | 0.012 |
| 4.709999999999775 | 0.036 | 0.018 | 0.012 |
| 4.719999999999774 | 0.036 | 0.018 | 0.012 |
| 4.729999999999774 | 0.036 | 0.018 | 0.012 |
| 4.739999999999774 | 0.035 | 0.018 | 0.012 |
| 4.749999999999774 | 0.035 | 0.018 | 0.012 |
| 4.759999999999774 | 0.035 | 0.018 | 0.012 |
| 4.769999999999774 | 0.035 | 0.018 | 0.012 |
| 4.779999999999773 | 0.035 | 0.017 | 0.012 |
| 4.789999999999773 | 0.035 | 0.017 | 0.012 |
| 4.799999999999773 | 0.035 | 0.017 | 0.012 |
| 4.809999999999773 | 0.035 | 0.017 | 0.012 |
| 4.819999999999773 | 0.034 | 0.017 | 0.011 |
| 4.829999999999773 | 0.034 | 0.017 | 0.011 |
| 4.839999999999772 | 0.034 | 0.017 | 0.011 |
| 4.849999999999772 | 0.034 | 0.017 | 0.011 |
| 4.859999999999772 | 0.034 | 0.017 | 0.011 |
| 4.869999999999772 | 0.034 | 0.017 | 0.011 |
| 4.879999999999771 | 0.034 | 0.017 | 0.011 |
| 4.889999999999771 | 0.034 | 0.017 | 0.011 |
| 4.899999999999771 | 0.033 | 0.017 | 0.011 |
| 4.90999999999977 | 0.033 | 0.017 | 0.011 |
| 4.91999999999977 | 0.033 | 0.017 | 0.011 |
| 4.92999999999977 | 0.033 | 0.017 | 0.011 |
| 4.93999999999977 | 0.033 | 0.016 | 0.011 |
| 4.94999999999977 | 0.033 | 0.016 | 0.011 |
| 4.95999999999977 | 0.033 | 0.016 | 0.011 |
| 4.96999999999977 | 0.033 | 0.016 | 0.011 |
| 4.97999999999977 | 0.032 | 0.016 | 0.011 |
| 4.98999999999977 | 0.032 | 0.016 | 0.011 |
| 4.99999999999977 | 0.032 | 0.016 | 0.011 |
| 5.009999999999768 | 0.032 | 0.016 | 0.011 |
| 5.019999999999768 | 0.032 | 0.016 | 0.011 |
| 5.029999999999768 | 0.032 | 0.016 | 0.011 |
| 5.039999999999768 | 0.032 | 0.016 | 0.011 |
| 5.049999999999767 | 0.032 | 0.016 | 0.011 |
| 5.059999999999767 | 0.032 | 0.016 | 0.011 |
| 5.069999999999767 | 0.031 | 0.016 | 0.01 |
| 5.079999999999767 | 0.031 | 0.016 | 0.01 |
| 5.089999999999767 | 0.031 | 0.016 | 0.01 |
| 5.099999999999766 | 0.031 | 0.016 | 0.01 |
| 5.109999999999766 | 0.031 | 0.016 | 0.01 |
| 5.119999999999766 | 0.031 | 0.015 | 0.01 |
| 5.129999999999766 | 0.031 | 0.015 | 0.01 |
| 5.139999999999766 | 0.031 | 0.015 | 0.01 |
| 5.149999999999765 | 0.031 | 0.015 | 0.01 |
| 5.159999999999765 | 0.031 | 0.015 | 0.01 |
| 5.169999999999765 | 0.03 | 0.015 | 0.01 |
| 5.179999999999765 | 0.03 | 0.015 | 0.01 |
| 5.189999999999764 | 0.03 | 0.015 | 0.01 |
| 5.199999999999764 | 0.03 | 0.015 | 0.01 |
| 5.209999999999764 | 0.03 | 0.015 | 0.01 |
| 5.219999999999764 | 0.03 | 0.015 | 0.01 |
| 5.229999999999764 | 0.03 | 0.015 | 0.01 |
| 5.239999999999763 | 0.03 | 0.015 | 0.01 |
| 5.249999999999763 | 0.03 | 0.015 | 0.01 |
| 5.259999999999763 | 0.029 | 0.015 | 0.01 |
| 5.269999999999763 | 0.029 | 0.015 | 0.01 |
| 5.279999999999763 | 0.029 | 0.015 | 0.01 |
| 5.289999999999762 | 0.029 | 0.015 | 0.01 |
| 5.299999999999762 | 0.029 | 0.015 | 0.01 |
| 5.309999999999762 | 0.029 | 0.014 | 0.01 |
| 5.319999999999762 | 0.029 | 0.014 | 0.01 |
| 5.329999999999762 | 0.029 | 0.014 | 0.01 |
| 5.339999999999761 | 0.029 | 0.014 | 0.01 |
| 5.349999999999761 | 0.029 | 0.014 | 0.01 |
| 5.359999999999761 | 0.028 | 0.014 | 0.009 |
| 5.369999999999761 | 0.028 | 0.014 | 0.009 |
| 5.37999999999976 | 0.028 | 0.014 | 0.009 |
| 5.38999999999976 | 0.028 | 0.014 | 0.009 |
| 5.39999999999976 | 0.028 | 0.014 | 0.009 |
| 5.40999999999976 | 0.028 | 0.014 | 0.009 |
| 5.41999999999976 | 0.028 | 0.014 | 0.009 |
| 5.42999999999976 | 0.028 | 0.014 | 0.009 |
| 5.43999999999976 | 0.028 | 0.014 | 0.009 |
| 5.44999999999976 | 0.028 | 0.014 | 0.009 |
| 5.45999999999976 | 0.028 | 0.014 | 0.009 |
| 5.46999999999976 | 0.027 | 0.014 | 0.009 |
| 5.479999999999758 | 0.027 | 0.014 | 0.009 |
| 5.489999999999758 | 0.027 | 0.014 | 0.009 |
| 5.499999999999758 | 0.027 | 0.014 | 0.009 |
| 5.509999999999758 | 0.027 | 0.014 | 0.009 |
| 5.519999999999758 | 0.027 | 0.014 | 0.009 |
| 5.529999999999758 | 0.027 | 0.013 | 0.009 |
| 5.539999999999757 | 0.027 | 0.013 | 0.009 |
| 5.549999999999757 | 0.027 | 0.013 | 0.009 |
| 5.559999999999757 | 0.027 | 0.013 | 0.009 |
| 5.569999999999757 | 0.027 | 0.013 | 0.009 |
| 5.579999999999756 | 0.027 | 0.013 | 0.009 |
| 5.589999999999756 | 0.026 | 0.013 | 0.009 |
| 5.599999999999756 | 0.026 | 0.013 | 0.009 |
| 5.609999999999756 | 0.026 | 0.013 | 0.009 |
| 5.619999999999756 | 0.026 | 0.013 | 0.009 |
| 5.629999999999756 | 0.026 | 0.013 | 0.009 |
| 5.639999999999755 | 0.026 | 0.013 | 0.009 |
| 5.649999999999755 | 0.026 | 0.013 | 0.009 |
| 5.659999999999755 | 0.026 | 0.013 | 0.009 |
| 5.669999999999755 | 0.026 | 0.013 | 0.009 |
| 5.679999999999754 | 0.026 | 0.013 | 0.009 |
| 5.689999999999754 | 0.026 | 0.013 | 0.009 |
| 5.699999999999754 | 0.026 | 0.013 | 0.009 |
| 5.709999999999754 | 0.025 | 0.013 | 0.008 |
| 5.719999999999754 | 0.025 | 0.013 | 0.008 |
| 5.729999999999753 | 0.025 | 0.013 | 0.008 |
| 5.739999999999753 | 0.025 | 0.013 | 0.008 |
| 5.749999999999753 | 0.025 | 0.013 | 0.008 |
| 5.759999999999753 | 0.025 | 0.013 | 0.008 |
| 5.769999999999753 | 0.025 | 0.012 | 0.008 |
| 5.779999999999752 | 0.025 | 0.012 | 0.008 |
| 5.789999999999752 | 0.025 | 0.012 | 0.008 |
| 5.799999999999752 | 0.025 | 0.012 | 0.008 |
| 5.809999999999752 | 0.025 | 0.012 | 0.008 |
| 5.819999999999752 | 0.025 | 0.012 | 0.008 |
| 5.829999999999751 | 0.024 | 0.012 | 0.008 |
| 5.839999999999751 | 0.024 | 0.012 | 0.008 |
| 5.849999999999751 | 0.024 | 0.012 | 0.008 |
| 5.859999999999751 | 0.024 | 0.012 | 0.008 |
| 5.86999999999975 | 0.024 | 0.012 | 0.008 |
| 5.87999999999975 | 0.024 | 0.012 | 0.008 |
| 5.88999999999975 | 0.024 | 0.012 | 0.008 |
| 5.89999999999975 | 0.024 | 0.012 | 0.008 |
| 5.90999999999975 | 0.024 | 0.012 | 0.008 |
| 5.91999999999975 | 0.024 | 0.012 | 0.008 |
| 5.92999999999975 | 0.024 | 0.012 | 0.008 |
| 5.93999999999975 | 0.024 | 0.012 | 0.008 |
| 5.949999999999748 | 0.024 | 0.012 | 0.008 |
| 5.959999999999748 | 0.024 | 0.012 | 0.008 |
| 5.969999999999748 | 0.023 | 0.012 | 0.008 |
| 5.979999999999748 | 0.023 | 0.012 | 0.008 |
| 5.989999999999747 | 0.023 | 0.012 | 0.008 |
| 5.999999999999747 | 0.023 | 0.012 | 0.008 |
| 6.009999999999747 | 0.023 | 0.012 | 0.008 |
| 6.019999999999747 | 0.023 | 0.012 | 0.008 |
| 6.029999999999747 | 0.023 | 0.012 | 0.008 |
| 6.039999999999746 | 0.023 | 0.011 | 0.008 |
| 6.049999999999746 | 0.023 | 0.011 | 0.008 |
| 6.059999999999746 | 0.023 | 0.011 | 0.008 |
| 6.069999999999746 | 0.023 | 0.011 | 0.008 |
| 6.079999999999746 | 0.023 | 0.011 | 0.008 |
| 6.089999999999745 | 0.023 | 0.011 | 0.008 |
| 6.099999999999745 | 0.023 | 0.011 | 0.008 |
| 6.109999999999745 | 0.023 | 0.011 | 0.008 |
| 6.119999999999745 | 0.022 | 0.011 | 0.007 |
| 6.129999999999745 | 0.022 | 0.011 | 0.007 |
| 6.139999999999744 | 0.022 | 0.011 | 0.007 |
| 6.149999999999744 | 0.022 | 0.011 | 0.007 |
| 6.159999999999744 | 0.022 | 0.011 | 0.007 |
| 6.169999999999744 | 0.022 | 0.011 | 0.007 |
| 6.179999999999744 | 0.022 | 0.011 | 0.007 |
| 6.189999999999744 | 0.022 | 0.011 | 0.007 |
| 6.199999999999743 | 0.022 | 0.011 | 0.007 |
| 6.209999999999743 | 0.022 | 0.011 | 0.007 |
| 6.219999999999743 | 0.022 | 0.011 | 0.007 |
| 6.229999999999743 | 0.022 | 0.011 | 0.007 |
| 6.239999999999742 | 0.022 | 0.011 | 0.007 |
| 6.249999999999742 | 0.022 | 0.011 | 0.007 |
| 6.259999999999742 | 0.022 | 0.011 | 0.007 |
| 6.269999999999742 | 0.021 | 0.011 | 0.007 |
| 6.279999999999741 | 0.021 | 0.011 | 0.007 |
| 6.289999999999741 | 0.021 | 0.011 | 0.007 |
| 6.299999999999741 | 0.021 | 0.011 | 0.007 |
| 6.309999999999741 | 0.021 | 0.011 | 0.007 |
| 6.319999999999741 | 0.021 | 0.011 | 0.007 |
| 6.329999999999741 | 0.021 | 0.011 | 0.007 |
| 6.33999999999974 | 0.021 | 0.011 | 0.007 |
| 6.34999999999974 | 0.021 | 0.01 | 0.007 |
| 6.35999999999974 | 0.021 | 0.01 | 0.007 |
| 6.36999999999974 | 0.021 | 0.01 | 0.007 |
| 6.37999999999974 | 0.021 | 0.01 | 0.007 |
| 6.38999999999974 | 0.021 | 0.01 | 0.007 |
| 6.39999999999974 | 0.021 | 0.01 | 0.007 |
| 6.409999999999738 | 0.021 | 0.01 | 0.007 |
| 6.419999999999738 | 0.021 | 0.01 | 0.007 |
| 6.429999999999738 | 0.021 | 0.01 | 0.007 |
| 6.439999999999738 | 0.02 | 0.01 | 0.007 |
| 6.449999999999738 | 0.02 | 0.01 | 0.007 |
| 6.459999999999737 | 0.02 | 0.01 | 0.007 |
| 6.469999999999737 | 0.02 | 0.01 | 0.007 |
| 6.479999999999737 | 0.02 | 0.01 | 0.007 |
| 6.489999999999737 | 0.02 | 0.01 | 0.007 |
| 6.499999999999737 | 0.02 | 0.01 | 0.007 |
| 6.509999999999736 | 0.02 | 0.01 | 0.007 |
| 6.519999999999736 | 0.02 | 0.01 | 0.007 |
| 6.529999999999736 | 0.02 | 0.01 | 0.007 |
| 6.539999999999736 | 0.02 | 0.01 | 0.007 |
| 6.549999999999736 | 0.02 | 0.01 | 0.007 |
| 6.559999999999735 | 0.02 | 0.01 | 0.007 |
| 6.569999999999735 | 0.02 | 0.01 | 0.007 |
| 6.579999999999735 | 0.02 | 0.01 | 0.007 |
| 6.589999999999735 | 0.02 | 0.01 | 0.007 |
| 6.599999999999734 | 0.02 | 0.01 | 0.007 |
| 6.609999999999734 | 0.019 | 0.01 | 0.006 |
| 6.619999999999734 | 0.019 | 0.01 | 0.006 |
| 6.629999999999734 | 0.019 | 0.01 | 0.006 |
| 6.639999999999734 | 0.019 | 0.01 | 0.006 |
| 6.649999999999734 | 0.019 | 0.01 | 0.006 |
| 6.659999999999734 | 0.019 | 0.01 | 0.006 |
| 6.669999999999733 | 0.019 | 0.01 | 0.006 |
| 6.679999999999733 | 0.019 | 0.01 | 0.006 |
| 6.689999999999733 | 0.019 | 0.01 | 0.006 |
| 6.699999999999733 | 0.019 | 0.01 | 0.006 |
| 6.709999999999732 | 0.019 | 0.009 | 0.006 |
| 6.719999999999732 | 0.019 | 0.009 | 0.006 |
| 6.729999999999732 | 0.019 | 0.009 | 0.006 |
| 6.739999999999731 | 0.019 | 0.009 | 0.006 |
| 6.749999999999731 | 0.019 | 0.009 | 0.006 |
| 6.759999999999731 | 0.019 | 0.009 | 0.006 |
| 6.769999999999731 | 0.019 | 0.009 | 0.006 |
| 6.77999999999973 | 0.019 | 0.009 | 0.006 |
| 6.78999999999973 | 0.019 | 0.009 | 0.006 |
| 6.79999999999973 | 0.019 | 0.009 | 0.006 |
| 6.80999999999973 | 0.018 | 0.009 | 0.006 |
| 6.81999999999973 | 0.018 | 0.009 | 0.006 |
| 6.82999999999973 | 0.018 | 0.009 | 0.006 |
| 6.83999999999973 | 0.018 | 0.009 | 0.006 |
| 6.84999999999973 | 0.018 | 0.009 | 0.006 |
| 6.85999999999973 | 0.018 | 0.009 | 0.006 |
| 6.86999999999973 | 0.018 | 0.009 | 0.006 |
| 6.879999999999728 | 0.018 | 0.009 | 0.006 |
| 6.889999999999728 | 0.018 | 0.009 | 0.006 |
| 6.899999999999728 | 0.018 | 0.009 | 0.006 |
| 6.909999999999728 | 0.018 | 0.009 | 0.006 |
| 6.919999999999728 | 0.018 | 0.009 | 0.006 |
| 6.929999999999727 | 0.018 | 0.009 | 0.006 |
| 6.939999999999727 | 0.018 | 0.009 | 0.006 |
| 6.949999999999727 | 0.018 | 0.009 | 0.006 |
| 6.959999999999727 | 0.018 | 0.009 | 0.006 |
| 6.969999999999727 | 0.018 | 0.009 | 0.006 |
| 6.979999999999726 | 0.018 | 0.009 | 0.006 |
| 6.989999999999726 | 0.018 | 0.009 | 0.006 |
| 6.999999999999726 | 0.018 | 0.009 | 0.006 |
| 7.009999999999726 | 0.017 | 0.009 | 0.006 |
| 7.019999999999726 | 0.017 | 0.009 | 0.006 |
| 7.029999999999725 | 0.017 | 0.009 | 0.006 |
| 7.039999999999725 | 0.017 | 0.009 | 0.006 |
| 7.049999999999725 | 0.017 | 0.009 | 0.006 |
| 7.059999999999725 | 0.017 | 0.009 | 0.006 |
| 7.069999999999724 | 0.017 | 0.009 | 0.006 |
| 7.079999999999724 | 0.017 | 0.009 | 0.006 |
| 7.089999999999724 | 0.017 | 0.009 | 0.006 |
| 7.099999999999724 | 0.017 | 0.009 | 0.006 |
| 7.109999999999724 | 0.017 | 0.009 | 0.006 |
| 7.119999999999724 | 0.017 | 0.009 | 0.006 |
| 7.129999999999724 | 0.017 | 0.008 | 0.006 |
| 7.139999999999723 | 0.017 | 0.008 | 0.006 |
| 7.149999999999723 | 0.017 | 0.008 | 0.006 |
| 7.159999999999723 | 0.017 | 0.008 | 0.006 |
| 7.169999999999723 | 0.017 | 0.008 | 0.006 |
| 7.179999999999722 | 0.017 | 0.008 | 0.006 |
| 7.189999999999722 | 0.017 | 0.008 | 0.006 |
| 7.199999999999722 | 0.017 | 0.008 | 0.006 |
| 7.209999999999721 | 0.017 | 0.008 | 0.006 |
| 7.219999999999721 | 0.017 | 0.008 | 0.006 |
| 7.229999999999721 | 0.017 | 0.008 | 0.006 |
| 7.23999999999972 | 0.016 | 0.008 | 0.005 |
| 7.24999999999972 | 0.016 | 0.008 | 0.005 |
| 7.25999999999972 | 0.016 | 0.008 | 0.005 |
| 7.26999999999972 | 0.016 | 0.008 | 0.005 |
| 7.27999999999972 | 0.016 | 0.008 | 0.005 |
| 7.28999999999972 | 0.016 | 0.008 | 0.005 |
| 7.29999999999972 | 0.016 | 0.008 | 0.005 |
| 7.30999999999972 | 0.016 | 0.008 | 0.005 |
| 7.31999999999972 | 0.016 | 0.008 | 0.005 |
| 7.329999999999719 | 0.016 | 0.008 | 0.005 |
| 7.33999999999972 | 0.016 | 0.008 | 0.005 |
| 7.349999999999719 | 0.016 | 0.008 | 0.005 |
| 7.359999999999719 | 0.016 | 0.008 | 0.005 |
| 7.369999999999718 | 0.016 | 0.008 | 0.005 |
| 7.379999999999718 | 0.016 | 0.008 | 0.005 |
| 7.389999999999718 | 0.016 | 0.008 | 0.005 |
| 7.399999999999718 | 0.016 | 0.008 | 0.005 |
| 7.409999999999717 | 0.016 | 0.008 | 0.005 |
| 7.419999999999717 | 0.016 | 0.008 | 0.005 |
| 7.429999999999717 | 0.016 | 0.008 | 0.005 |
| 7.439999999999717 | 0.016 | 0.008 | 0.005 |
| 7.449999999999716 | 0.016 | 0.008 | 0.005 |
| 7.459999999999716 | 0.016 | 0.008 | 0.005 |
| 7.469999999999716 | 0.016 | 0.008 | 0.005 |
| 7.479999999999716 | 0.016 | 0.008 | 0.005 |
| 7.489999999999715 | 0.015 | 0.008 | 0.005 |
| 7.499999999999715 | 0.015 | 0.008 | 0.005 |
| 7.509999999999715 | 0.015 | 0.008 | 0.005 |
| 7.519999999999715 | 0.015 | 0.008 | 0.005 |
| 7.529999999999715 | 0.015 | 0.008 | 0.005 |
| 7.539999999999714 | 0.015 | 0.008 | 0.005 |
| 7.549999999999714 | 0.015 | 0.008 | 0.005 |
| 7.559999999999714 | 0.015 | 0.008 | 0.005 |
| 7.569999999999714 | 0.015 | 0.008 | 0.005 |
| 7.579999999999714 | 0.015 | 0.008 | 0.005 |
| 7.589999999999714 | 0.015 | 0.008 | 0.005 |
| 7.599999999999714 | 0.015 | 0.008 | 0.005 |
| 7.609999999999713 | 0.015 | 0.008 | 0.005 |
| 7.619999999999713 | 0.015 | 0.007 | 0.005 |
| 7.629999999999713 | 0.015 | 0.007 | 0.005 |
| 7.639999999999713 | 0.015 | 0.007 | 0.005 |
| 7.649999999999712 | 0.015 | 0.007 | 0.005 |
| 7.659999999999712 | 0.015 | 0.007 | 0.005 |
| 7.669999999999712 | 0.015 | 0.007 | 0.005 |
| 7.679999999999712 | 0.015 | 0.007 | 0.005 |
| 7.689999999999712 | 0.015 | 0.007 | 0.005 |
| 7.699999999999711 | 0.015 | 0.007 | 0.005 |
| 7.709999999999711 | 0.015 | 0.007 | 0.005 |
| 7.719999999999711 | 0.015 | 0.007 | 0.005 |
| 7.729999999999711 | 0.015 | 0.007 | 0.005 |
| 7.73999999999971 | 0.015 | 0.007 | 0.005 |
| 7.74999999999971 | 0.015 | 0.007 | 0.005 |
| 7.75999999999971 | 0.014 | 0.007 | 0.005 |
| 7.76999999999971 | 0.014 | 0.007 | 0.005 |
| 7.77999999999971 | 0.014 | 0.007 | 0.005 |
| 7.78999999999971 | 0.014 | 0.007 | 0.005 |
| 7.79999999999971 | 0.014 | 0.007 | 0.005 |
| 7.80999999999971 | 0.014 | 0.007 | 0.005 |
| 7.819999999999709 | 0.014 | 0.007 | 0.005 |
| 7.829999999999709 | 0.014 | 0.007 | 0.005 |
| 7.839999999999708 | 0.014 | 0.007 | 0.005 |
| 7.849999999999708 | 0.014 | 0.007 | 0.005 |
| 7.859999999999708 | 0.014 | 0.007 | 0.005 |
| 7.869999999999708 | 0.014 | 0.007 | 0.005 |
| 7.879999999999707 | 0.014 | 0.007 | 0.005 |
| 7.889999999999707 | 0.014 | 0.007 | 0.005 |
| 7.899999999999707 | 0.014 | 0.007 | 0.005 |
| 7.909999999999707 | 0.014 | 0.007 | 0.005 |
| 7.919999999999706 | 0.014 | 0.007 | 0.005 |
| 7.929999999999706 | 0.014 | 0.007 | 0.005 |
| 7.939999999999706 | 0.014 | 0.007 | 0.005 |
| 7.949999999999706 | 0.014 | 0.007 | 0.005 |
| 7.959999999999705 | 0.014 | 0.007 | 0.005 |
| 7.969999999999705 | 0.014 | 0.007 | 0.005 |
| 7.979999999999705 | 0.014 | 0.007 | 0.005 |
| 7.989999999999705 | 0.014 | 0.007 | 0.005 |
| 7.999999999999705 | 0.014 | 0.007 | 0.005 |
| 8.009999999999703 | 0.014 | 0.007 | 0.005 |
| 8.019999999999705 | 0.014 | 0.007 | 0.005 |
| 8.029999999999704 | 0.014 | 0.007 | 0.005 |
| 8.039999999999704 | 0.014 | 0.007 | 0.005 |
| 8.049999999999704 | 0.014 | 0.007 | 0.005 |
| 8.059999999999704 | 0.014 | 0.007 | 0.005 |
| 8.069999999999704 | 0.013 | 0.007 | 0.004 |
| 8.079999999999703 | 0.013 | 0.007 | 0.004 |
| 8.089999999999703 | 0.013 | 0.007 | 0.004 |
| 8.099999999999701 | 0.013 | 0.007 | 0.004 |
| 8.109999999999703 | 0.013 | 0.007 | 0.004 |
| 8.119999999999703 | 0.013 | 0.007 | 0.004 |
| 8.129999999999702 | 0.013 | 0.007 | 0.004 |
| 8.139999999999702 | 0.013 | 0.007 | 0.004 |
| 8.1499999999997 | 0.013 | 0.007 | 0.004 |
| 8.1599999999997 | 0.013 | 0.007 | 0.004 |
| 8.1699999999997 | 0.013 | 0.007 | 0.004 |
| 8.1799999999997 | 0.013 | 0.007 | 0.004 |
| 8.1899999999997 | 0.013 | 0.007 | 0.004 |
| 8.1999999999997 | 0.013 | 0.007 | 0.004 |
| 8.2099999999997 | 0.013 | 0.007 | 0.004 |
| 8.2199999999997 | 0.013 | 0.007 | 0.004 |
| 8.2299999999997 | 0.013 | 0.006 | 0.004 |
| 8.2399999999997 | 0.013 | 0.006 | 0.004 |
| 8.2499999999997 | 0.013 | 0.006 | 0.004 |
| 8.2599999999997 | 0.013 | 0.006 | 0.004 |
| 8.2699999999997 | 0.013 | 0.006 | 0.004 |
| 8.2799999999997 | 0.013 | 0.006 | 0.004 |
| 8.289999999999697 | 0.013 | 0.006 | 0.004 |
| 8.299999999999699 | 0.013 | 0.006 | 0.004 |
| 8.309999999999699 | 0.013 | 0.006 | 0.004 |
| 8.319999999999698 | 0.013 | 0.006 | 0.004 |
| 8.329999999999698 | 0.013 | 0.006 | 0.004 |
| 8.339999999999698 | 0.013 | 0.006 | 0.004 |
| 8.349999999999698 | 0.013 | 0.006 | 0.004 |
| 8.359999999999697 | 0.013 | 0.006 | 0.004 |
| 8.369999999999697 | 0.013 | 0.006 | 0.004 |
| 8.379999999999695 | 0.013 | 0.006 | 0.004 |
| 8.389999999999697 | 0.013 | 0.006 | 0.004 |
| 8.399999999999697 | 0.013 | 0.006 | 0.004 |
| 8.409999999999696 | 0.012 | 0.006 | 0.004 |
| 8.419999999999696 | 0.012 | 0.006 | 0.004 |
| 8.429999999999694 | 0.012 | 0.006 | 0.004 |
| 8.439999999999696 | 0.012 | 0.006 | 0.004 |
| 8.449999999999696 | 0.012 | 0.006 | 0.004 |
| 8.459999999999695 | 0.012 | 0.006 | 0.004 |
| 8.469999999999695 | 0.012 | 0.006 | 0.004 |
| 8.479999999999693 | 0.012 | 0.006 | 0.004 |
| 8.489999999999695 | 0.012 | 0.006 | 0.004 |
| 8.499999999999694 | 0.012 | 0.006 | 0.004 |
| 8.509999999999694 | 0.012 | 0.006 | 0.004 |
| 8.519999999999694 | 0.012 | 0.006 | 0.004 |
| 8.529999999999694 | 0.012 | 0.006 | 0.004 |
| 8.539999999999694 | 0.012 | 0.006 | 0.004 |
| 8.549999999999693 | 0.012 | 0.006 | 0.004 |
| 8.55999999999969 | 0.012 | 0.006 | 0.004 |
| 8.56999999999969 | 0.012 | 0.006 | 0.004 |
| 8.57999999999969 | 0.012 | 0.006 | 0.004 |
| 8.58999999999969 | 0.012 | 0.006 | 0.004 |
| 8.59999999999969 | 0.012 | 0.006 | 0.004 |
| 8.60999999999969 | 0.012 | 0.006 | 0.004 |
| 8.61999999999969 | 0.012 | 0.006 | 0.004 |
| 8.62999999999969 | 0.012 | 0.006 | 0.004 |
| 8.63999999999969 | 0.012 | 0.006 | 0.004 |
| 8.64999999999969 | 0.012 | 0.006 | 0.004 |
| 8.65999999999969 | 0.012 | 0.006 | 0.004 |
| 8.66999999999969 | 0.012 | 0.006 | 0.004 |
| 8.67999999999969 | 0.012 | 0.006 | 0.004 |
| 8.68999999999969 | 0.012 | 0.006 | 0.004 |
| 8.69999999999969 | 0.012 | 0.006 | 0.004 |
| 8.70999999999969 | 0.012 | 0.006 | 0.004 |
| 8.71999999999969 | 0.012 | 0.006 | 0.004 |
| 8.72999999999969 | 0.012 | 0.006 | 0.004 |
| 8.73999999999969 | 0.012 | 0.006 | 0.004 |
| 8.74999999999969 | 0.012 | 0.006 | 0.004 |
| 8.759999999999687 | 0.012 | 0.006 | 0.004 |
| 8.769999999999689 | 0.012 | 0.006 | 0.004 |
| 8.779999999999688 | 0.012 | 0.006 | 0.004 |
| 8.789999999999688 | 0.011 | 0.006 | 0.004 |
| 8.799999999999686 | 0.011 | 0.006 | 0.004 |
| 8.809999999999688 | 0.011 | 0.006 | 0.004 |
| 8.819999999999688 | 0.011 | 0.006 | 0.004 |
| 8.829999999999687 | 0.011 | 0.006 | 0.004 |
| 8.839999999999687 | 0.011 | 0.006 | 0.004 |
| 8.849999999999685 | 0.011 | 0.006 | 0.004 |
| 8.859999999999687 | 0.011 | 0.006 | 0.004 |
| 8.869999999999687 | 0.011 | 0.006 | 0.004 |
| 8.879999999999686 | 0.011 | 0.006 | 0.004 |
| 8.889999999999686 | 0.011 | 0.006 | 0.004 |
| 8.899999999999684 | 0.011 | 0.006 | 0.004 |
| 8.909999999999686 | 0.011 | 0.006 | 0.004 |
| 8.919999999999686 | 0.011 | 0.006 | 0.004 |
| 8.929999999999685 | 0.011 | 0.006 | 0.004 |
| 8.939999999999685 | 0.011 | 0.006 | 0.004 |
| 8.949999999999685 | 0.011 | 0.006 | 0.004 |
| 8.959999999999685 | 0.011 | 0.006 | 0.004 |
| 8.969999999999684 | 0.011 | 0.006 | 0.004 |
| 8.979999999999684 | 0.011 | 0.006 | 0.004 |
| 8.989999999999682 | 0.011 | 0.006 | 0.004 |
| 8.999999999999684 | 0.011 | 0.005 | 0.004 |
| 9.009999999999684 | 0.011 | 0.005 | 0.004 |
| 9.019999999999683 | 0.011 | 0.005 | 0.004 |
| 9.029999999999683 | 0.011 | 0.005 | 0.004 |
| 9.039999999999681 | 0.011 | 0.005 | 0.004 |
| 9.049999999999683 | 0.011 | 0.005 | 0.004 |
| 9.05999999999968 | 0.011 | 0.005 | 0.004 |
| 9.06999999999968 | 0.011 | 0.005 | 0.004 |
| 9.07999999999968 | 0.011 | 0.005 | 0.004 |
| 9.08999999999968 | 0.011 | 0.005 | 0.004 |
| 9.09999999999968 | 0.011 | 0.005 | 0.004 |
| 9.10999999999968 | 0.011 | 0.005 | 0.004 |
| 9.11999999999968 | 0.011 | 0.005 | 0.004 |
| 9.12999999999968 | 0.011 | 0.005 | 0.004 |
| 9.13999999999968 | 0.011 | 0.005 | 0.004 |
| 9.14999999999968 | 0.011 | 0.005 | 0.004 |
| 9.15999999999968 | 0.011 | 0.005 | 0.004 |
| 9.16999999999968 | 0.011 | 0.005 | 0.004 |
| 9.17999999999968 | 0.011 | 0.005 | 0.004 |
| 9.18999999999968 | 0.011 | 0.005 | 0.004 |
| 9.19999999999968 | 0.011 | 0.005 | 0.004 |
| 9.20999999999968 | 0.011 | 0.005 | 0.004 |
| 9.21999999999968 | 0.011 | 0.005 | 0.004 |
| 9.229999999999677 | 0.01 | 0.005 | 0.003 |
| 9.239999999999679 | 0.01 | 0.005 | 0.003 |
| 9.249999999999678 | 0.01 | 0.005 | 0.003 |
| 9.259999999999678 | 0.01 | 0.005 | 0.003 |
| 9.269999999999678 | 0.01 | 0.005 | 0.003 |
| 9.279999999999678 | 0.01 | 0.005 | 0.003 |
| 9.289999999999678 | 0.01 | 0.005 | 0.003 |
| 9.299999999999677 | 0.01 | 0.005 | 0.003 |
| 9.309999999999677 | 0.01 | 0.005 | 0.003 |
| 9.319999999999675 | 0.01 | 0.005 | 0.003 |
| 9.329999999999677 | 0.01 | 0.005 | 0.003 |
| 9.339999999999677 | 0.01 | 0.005 | 0.003 |
| 9.349999999999676 | 0.01 | 0.005 | 0.003 |
| 9.359999999999676 | 0.01 | 0.005 | 0.003 |
| 9.369999999999674 | 0.01 | 0.005 | 0.003 |
| 9.379999999999676 | 0.01 | 0.005 | 0.003 |
| 9.389999999999675 | 0.01 | 0.005 | 0.003 |
| 9.399999999999675 | 0.01 | 0.005 | 0.003 |
| 9.409999999999675 | 0.01 | 0.005 | 0.003 |
| 9.419999999999675 | 0.01 | 0.005 | 0.003 |
| 9.429999999999675 | 0.01 | 0.005 | 0.003 |
| 9.439999999999674 | 0.01 | 0.005 | 0.003 |
| 9.449999999999674 | 0.01 | 0.005 | 0.003 |
| 9.459999999999672 | 0.01 | 0.005 | 0.003 |
| 9.469999999999674 | 0.01 | 0.005 | 0.003 |
| 9.479999999999674 | 0.01 | 0.005 | 0.003 |
| 9.489999999999673 | 0.01 | 0.005 | 0.003 |
| 9.499999999999673 | 0.01 | 0.005 | 0.003 |
| 9.509999999999671 | 0.01 | 0.005 | 0.003 |
| 9.519999999999673 | 0.01 | 0.005 | 0.003 |
| 9.529999999999673 | 0.01 | 0.005 | 0.003 |
| 9.539999999999672 | 0.01 | 0.005 | 0.003 |
| 9.549999999999672 | 0.01 | 0.005 | 0.003 |
| 9.55999999999967 | 0.01 | 0.005 | 0.003 |
| 9.56999999999967 | 0.01 | 0.005 | 0.003 |
| 9.57999999999967 | 0.01 | 0.005 | 0.003 |
| 9.58999999999967 | 0.01 | 0.005 | 0.003 |
| 9.59999999999967 | 0.01 | 0.005 | 0.003 |
| 9.60999999999967 | 0.01 | 0.005 | 0.003 |
| 9.61999999999967 | 0.01 | 0.005 | 0.003 |
| 9.62999999999967 | 0.01 | 0.005 | 0.003 |
| 9.63999999999967 | 0.01 | 0.005 | 0.003 |
| 9.64999999999967 | 0.01 | 0.005 | 0.003 |
| 9.65999999999967 | 0.01 | 0.005 | 0.003 |
| 9.66999999999967 | 0.01 | 0.005 | 0.003 |
| 9.67999999999967 | 0.01 | 0.005 | 0.003 |
| 9.689999999999667 | 0.01 | 0.005 | 0.003 |
| 9.699999999999669 | 0.01 | 0.005 | 0.003 |
| 9.709999999999669 | 0.01 | 0.005 | 0.003 |
| 9.719999999999668 | 0.01 | 0.005 | 0.003 |
| 9.729999999999668 | 0.009 | 0.005 | 0.003 |
| 9.739999999999666 | 0.009 | 0.005 | 0.003 |
| 9.749999999999668 | 0.009 | 0.005 | 0.003 |
| 9.759999999999668 | 0.009 | 0.005 | 0.003 |
| 9.769999999999667 | 0.009 | 0.005 | 0.003 |
| 9.779999999999667 | 0.009 | 0.005 | 0.003 |
| 9.789999999999665 | 0.009 | 0.005 | 0.003 |
| 9.799999999999667 | 0.009 | 0.005 | 0.003 |
| 9.809999999999667 | 0.009 | 0.005 | 0.003 |
| 9.819999999999666 | 0.009 | 0.005 | 0.003 |
| 9.829999999999666 | 0.009 | 0.005 | 0.003 |
| 9.839999999999664 | 0.009 | 0.005 | 0.003 |
| 9.849999999999666 | 0.009 | 0.005 | 0.003 |
| 9.859999999999665 | 0.009 | 0.005 | 0.003 |
| 9.869999999999665 | 0.009 | 0.005 | 0.003 |
| 9.879999999999663 | 0.009 | 0.005 | 0.003 |
| 9.889999999999665 | 0.009 | 0.005 | 0.003 |
| 9.899999999999665 | 0.009 | 0.005 | 0.003 |
| 9.909999999999664 | 0.009 | 0.005 | 0.003 |
| 9.919999999999664 | 0.009 | 0.005 | 0.003 |
| 9.929999999999662 | 0.009 | 0.005 | 0.003 |
| 9.939999999999664 | 0.009 | 0.005 | 0.003 |
| 9.949999999999664 | 0.009 | 0.005 | 0.003 |
| 9.95999999999966 | 0.009 | 0.005 | 0.003 |
| 9.96999999999966 | 0.009 | 0.005 | 0.003 |
| 9.97999999999966 | 0.009 | 0.005 | 0.003 |
| 9.98999999999966 | 0.009 | 0.005 | 0.003 |
| 9.99999999999966 | 0.009 | 0.005 | 0.003 |